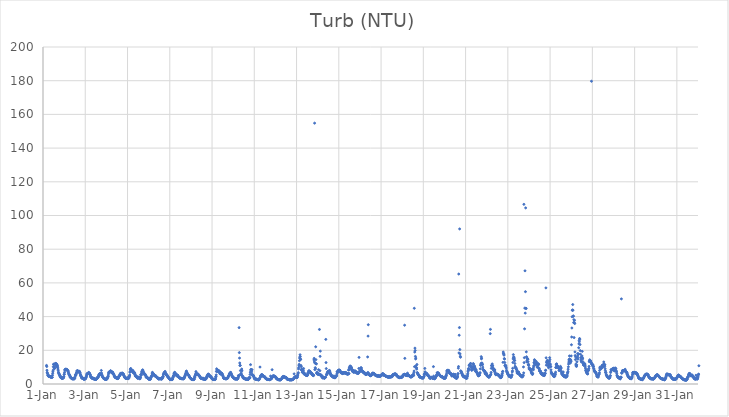
| Category | Turb (NTU) |
|---|---|
| 44927.166666666664 | 11.04 |
| 44927.177083333336 | 10.35 |
| 44927.1875 | 8.16 |
| 44927.197916666664 | 6.94 |
| 44927.208333333336 | 6.43 |
| 44927.21875 | 6.01 |
| 44927.229166666664 | 5.21 |
| 44927.239583333336 | 4.99 |
| 44927.25 | 4.79 |
| 44927.260416666664 | 4.72 |
| 44927.270833333336 | 4.5 |
| 44927.28125 | 4.51 |
| 44927.291666666664 | 4.56 |
| 44927.302083333336 | 4.73 |
| 44927.3125 | 4.68 |
| 44927.322916666664 | 4.47 |
| 44927.333333333336 | 4.37 |
| 44927.34375 | 4.4 |
| 44927.354166666664 | 4.08 |
| 44927.364583333336 | 4.2 |
| 44927.375 | 4.02 |
| 44927.385416666664 | 4.43 |
| 44927.395833333336 | 4.22 |
| 44927.40625 | 3.93 |
| 44927.416666666664 | 4.08 |
| 44927.427083333336 | 3.97 |
| 44927.4375 | 3.98 |
| 44927.447916666664 | 5.19 |
| 44927.458333333336 | 6.29 |
| 44927.46875 | 7.29 |
| 44927.479166666664 | 8.19 |
| 44927.489583333336 | 10.31 |
| 44927.5 | 11.69 |
| 44927.510416666664 | 11.7 |
| 44927.520833333336 | 9.62 |
| 44927.53125 | 9.53 |
| 44927.541666666664 | 9.23 |
| 44927.552083333336 | 9.35 |
| 44927.5625 | 10.55 |
| 44927.572916666664 | 11.88 |
| 44927.583333333336 | 12.15 |
| 44927.59375 | 12.2 |
| 44927.604166666664 | 11.62 |
| 44927.614583333336 | 11.5 |
| 44927.625 | 12.05 |
| 44927.635416666664 | 11.99 |
| 44927.645833333336 | 10.56 |
| 44927.65625 | 11.09 |
| 44927.666666666664 | 11.47 |
| 44927.677083333336 | 10.26 |
| 44927.6875 | 10.74 |
| 44927.697916666664 | 9.64 |
| 44927.708333333336 | 8.85 |
| 44927.71875 | 8.13 |
| 44927.729166666664 | 7.06 |
| 44927.739583333336 | 6.57 |
| 44927.75 | 6.37 |
| 44927.760416666664 | 5.94 |
| 44927.770833333336 | 5.75 |
| 44927.78125 | 5.54 |
| 44927.791666666664 | 5.01 |
| 44927.802083333336 | 4.73 |
| 44927.8125 | 4.63 |
| 44927.822916666664 | 4.13 |
| 44927.833333333336 | 4.05 |
| 44927.84375 | 3.89 |
| 44927.854166666664 | 3.79 |
| 44927.864583333336 | 3.78 |
| 44927.875 | 3.69 |
| 44927.885416666664 | 4.15 |
| 44927.895833333336 | 3.27 |
| 44927.90625 | 3.4 |
| 44927.916666666664 | 3.38 |
| 44927.927083333336 | 3.69 |
| 44927.9375 | 3.47 |
| 44927.947916666664 | 3.64 |
| 44927.958333333336 | 3.5 |
| 44927.96875 | 3.75 |
| 44927.979166666664 | 4.19 |
| 44927.989583333336 | 4.29 |
| 44928.0 | 5.65 |
| 44928.010416666664 | 5.83 |
| 44928.020833333336 | 6.93 |
| 44928.03125 | 8.22 |
| 44928.041666666664 | 8.55 |
| 44928.052083333336 | 8.48 |
| 44928.0625 | 8.83 |
| 44928.072916666664 | 8.27 |
| 44928.083333333336 | 8.49 |
| 44928.09375 | 8.52 |
| 44928.104166666664 | 8.64 |
| 44928.114583333336 | 8.69 |
| 44928.125 | 8.58 |
| 44928.135416666664 | 8.53 |
| 44928.145833333336 | 8.28 |
| 44928.15625 | 8.08 |
| 44928.166666666664 | 8.02 |
| 44928.177083333336 | 7.82 |
| 44928.1875 | 7.73 |
| 44928.197916666664 | 7.19 |
| 44928.208333333336 | 6.56 |
| 44928.21875 | 6.07 |
| 44928.229166666664 | 5.83 |
| 44928.239583333336 | 5.54 |
| 44928.25 | 5.04 |
| 44928.260416666664 | 5.17 |
| 44928.270833333336 | 4.98 |
| 44928.28125 | 4.26 |
| 44928.291666666664 | 4.02 |
| 44928.302083333336 | 4.07 |
| 44928.3125 | 3.96 |
| 44928.322916666664 | 3.74 |
| 44928.333333333336 | 3.45 |
| 44928.34375 | 3.41 |
| 44928.354166666664 | 3.43 |
| 44928.364583333336 | 3.43 |
| 44928.375 | 3.05 |
| 44928.385416666664 | 3.18 |
| 44928.395833333336 | 3.08 |
| 44928.40625 | 3.16 |
| 44928.416666666664 | 3.12 |
| 44928.427083333336 | 3.16 |
| 44928.4375 | 3.02 |
| 44928.447916666664 | 3.37 |
| 44928.458333333336 | 3.13 |
| 44928.46875 | 2.91 |
| 44928.479166666664 | 3.14 |
| 44928.489583333336 | 3.39 |
| 44928.5 | 3.57 |
| 44928.510416666664 | 3.53 |
| 44928.520833333336 | 4.25 |
| 44928.53125 | 5.39 |
| 44928.541666666664 | 5.11 |
| 44928.552083333336 | 5.24 |
| 44928.5625 | 5.67 |
| 44928.572916666664 | 6.07 |
| 44928.583333333336 | 6.52 |
| 44928.59375 | 6.96 |
| 44928.604166666664 | 7.66 |
| 44928.614583333336 | 7.87 |
| 44928.625 | 7.7 |
| 44928.635416666664 | 7.83 |
| 44928.645833333336 | 7.6 |
| 44928.65625 | 7.69 |
| 44928.666666666664 | 7.58 |
| 44928.677083333336 | 7.09 |
| 44928.6875 | 7.25 |
| 44928.697916666664 | 7.41 |
| 44928.708333333336 | 7.22 |
| 44928.71875 | 7.2 |
| 44928.729166666664 | 7.51 |
| 44928.739583333336 | 6.81 |
| 44928.75 | 6.71 |
| 44928.760416666664 | 6.01 |
| 44928.770833333336 | 5.35 |
| 44928.78125 | 4.98 |
| 44928.791666666664 | 5.2 |
| 44928.802083333336 | 4.6 |
| 44928.8125 | 4.38 |
| 44928.822916666664 | 3.95 |
| 44928.833333333336 | 3.57 |
| 44928.84375 | 3.47 |
| 44928.854166666664 | 3.49 |
| 44928.864583333336 | 3.77 |
| 44928.875 | 3.66 |
| 44928.885416666664 | 3.42 |
| 44928.895833333336 | 3.3 |
| 44928.90625 | 3.07 |
| 44928.916666666664 | 3.06 |
| 44928.927083333336 | 2.87 |
| 44928.9375 | 3.05 |
| 44928.947916666664 | 2.99 |
| 44928.958333333336 | 3.01 |
| 44928.96875 | 2.93 |
| 44928.979166666664 | 2.96 |
| 44928.989583333336 | 2.9 |
| 44929.0 | 3.2 |
| 44929.010416666664 | 3.2 |
| 44929.020833333336 | 3.29 |
| 44929.03125 | 3.83 |
| 44929.041666666664 | 4.02 |
| 44929.052083333336 | 4.47 |
| 44929.0625 | 5 |
| 44929.072916666664 | 5.66 |
| 44929.083333333336 | 5.97 |
| 44929.09375 | 6.15 |
| 44929.104166666664 | 6.16 |
| 44929.114583333336 | 6.25 |
| 44929.125 | 6.34 |
| 44929.135416666664 | 6.19 |
| 44929.145833333336 | 6.5 |
| 44929.15625 | 6.58 |
| 44929.166666666664 | 6.89 |
| 44929.177083333336 | 6.24 |
| 44929.1875 | 6.19 |
| 44929.197916666664 | 6.05 |
| 44929.208333333336 | 6.41 |
| 44929.21875 | 5.75 |
| 44929.229166666664 | 5.62 |
| 44929.239583333336 | 5.28 |
| 44929.25 | 4.64 |
| 44929.260416666664 | 4.24 |
| 44929.270833333336 | 4.07 |
| 44929.28125 | 3.88 |
| 44929.291666666664 | 4.08 |
| 44929.302083333336 | 3.79 |
| 44929.3125 | 3.6 |
| 44929.322916666664 | 3.49 |
| 44929.333333333336 | 3.29 |
| 44929.34375 | 3.26 |
| 44929.354166666664 | 3.28 |
| 44929.364583333336 | 3.53 |
| 44929.375 | 3.43 |
| 44929.385416666664 | 3.15 |
| 44929.395833333336 | 3.22 |
| 44929.40625 | 2.95 |
| 44929.416666666664 | 3.07 |
| 44929.427083333336 | 3.03 |
| 44929.4375 | 2.96 |
| 44929.447916666664 | 2.78 |
| 44929.458333333336 | 2.98 |
| 44929.46875 | 2.93 |
| 44929.479166666664 | 2.8 |
| 44929.489583333336 | 2.75 |
| 44929.5 | 2.71 |
| 44929.510416666664 | 2.78 |
| 44929.520833333336 | 2.87 |
| 44929.53125 | 3.08 |
| 44929.541666666664 | 3.18 |
| 44929.552083333336 | 3.38 |
| 44929.5625 | 3.32 |
| 44929.572916666664 | 3.42 |
| 44929.583333333336 | 3.84 |
| 44929.59375 | 4.21 |
| 44929.604166666664 | 4.13 |
| 44929.614583333336 | 4.11 |
| 44929.625 | 4.44 |
| 44929.635416666664 | 5.03 |
| 44929.645833333336 | 5.48 |
| 44929.65625 | 5.76 |
| 44929.666666666664 | 5.92 |
| 44929.677083333336 | 6.07 |
| 44929.6875 | 6.01 |
| 44929.697916666664 | 5.88 |
| 44929.708333333336 | 5.85 |
| 44929.71875 | 6.12 |
| 44929.729166666664 | 5.96 |
| 44929.739583333336 | 5.66 |
| 44929.75 | 5.52 |
| 44929.760416666664 | 8.04 |
| 44929.770833333336 | 6.48 |
| 44929.78125 | 5.71 |
| 44929.791666666664 | 5.17 |
| 44929.802083333336 | 4.7 |
| 44929.8125 | 4.46 |
| 44929.822916666664 | 4.21 |
| 44929.833333333336 | 4.15 |
| 44929.84375 | 3.92 |
| 44929.854166666664 | 3.6 |
| 44929.864583333336 | 3.44 |
| 44929.875 | 3.28 |
| 44929.885416666664 | 3.18 |
| 44929.895833333336 | 3.23 |
| 44929.90625 | 3.12 |
| 44929.916666666664 | 2.92 |
| 44929.927083333336 | 2.87 |
| 44929.9375 | 2.99 |
| 44929.947916666664 | 2.88 |
| 44929.958333333336 | 2.89 |
| 44929.96875 | 2.84 |
| 44929.979166666664 | 2.81 |
| 44929.989583333336 | 2.76 |
| 44930.0 | 2.77 |
| 44930.010416666664 | 3.1 |
| 44930.020833333336 | 2.85 |
| 44930.03125 | 3.12 |
| 44930.041666666664 | 3.55 |
| 44930.052083333336 | 3.82 |
| 44930.0625 | 3.78 |
| 44930.072916666664 | 4.59 |
| 44930.083333333336 | 4.47 |
| 44930.09375 | 5.38 |
| 44930.104166666664 | 6.3 |
| 44930.114583333336 | 7 |
| 44930.125 | 6.89 |
| 44930.135416666664 | 7.06 |
| 44930.145833333336 | 7.14 |
| 44930.15625 | 7.07 |
| 44930.166666666664 | 7.34 |
| 44930.177083333336 | 7.31 |
| 44930.1875 | 7.54 |
| 44930.197916666664 | 7.92 |
| 44930.208333333336 | 7.52 |
| 44930.21875 | 7.3 |
| 44930.229166666664 | 7.2 |
| 44930.239583333336 | 6.94 |
| 44930.25 | 6.66 |
| 44930.260416666664 | 6.83 |
| 44930.270833333336 | 6.94 |
| 44930.28125 | 7.03 |
| 44930.291666666664 | 7.11 |
| 44930.302083333336 | 6.64 |
| 44930.3125 | 6.5 |
| 44930.322916666664 | 6.05 |
| 44930.333333333336 | 5.96 |
| 44930.34375 | 5.67 |
| 44930.354166666664 | 5.55 |
| 44930.364583333336 | 4.81 |
| 44930.375 | 4.81 |
| 44930.385416666664 | 4.62 |
| 44930.395833333336 | 4.26 |
| 44930.40625 | 4.07 |
| 44930.416666666664 | 3.89 |
| 44930.427083333336 | 3.91 |
| 44930.4375 | 3.83 |
| 44930.447916666664 | 3.81 |
| 44930.458333333336 | 3.61 |
| 44930.46875 | 3.64 |
| 44930.479166666664 | 3.36 |
| 44930.489583333336 | 3.45 |
| 44930.5 | 3.64 |
| 44930.510416666664 | 3.4 |
| 44930.520833333336 | 3.48 |
| 44930.53125 | 3.28 |
| 44930.541666666664 | 3.17 |
| 44930.552083333336 | 3.39 |
| 44930.5625 | 3.46 |
| 44930.572916666664 | 4.25 |
| 44930.583333333336 | 4.22 |
| 44930.59375 | 4.57 |
| 44930.604166666664 | 4.78 |
| 44930.614583333336 | 4.58 |
| 44930.625 | 4.94 |
| 44930.635416666664 | 5.38 |
| 44930.645833333336 | 5.58 |
| 44930.65625 | 5.97 |
| 44930.666666666664 | 6.3 |
| 44930.677083333336 | 6.11 |
| 44930.6875 | 5.92 |
| 44930.697916666664 | 5.91 |
| 44930.708333333336 | 6.01 |
| 44930.71875 | 6.24 |
| 44930.729166666664 | 6.34 |
| 44930.739583333336 | 6.43 |
| 44930.75 | 6.48 |
| 44930.760416666664 | 6.23 |
| 44930.770833333336 | 6.29 |
| 44930.78125 | 6.02 |
| 44930.791666666664 | 5.92 |
| 44930.802083333336 | 5.67 |
| 44930.8125 | 5.81 |
| 44930.822916666664 | 5.21 |
| 44930.833333333336 | 4.99 |
| 44930.84375 | 4.62 |
| 44930.854166666664 | 4.29 |
| 44930.864583333336 | 3.92 |
| 44930.875 | 3.88 |
| 44930.885416666664 | 3.66 |
| 44930.895833333336 | 3.56 |
| 44930.90625 | 3.41 |
| 44930.916666666664 | 3.5 |
| 44930.927083333336 | 3.39 |
| 44930.9375 | 3.4 |
| 44930.947916666664 | 3.44 |
| 44930.958333333336 | 3.35 |
| 44930.96875 | 3.35 |
| 44930.979166666664 | 3.42 |
| 44930.989583333336 | 3.35 |
| 44931.0 | 3.58 |
| 44931.010416666664 | 3.66 |
| 44931.020833333336 | 3.41 |
| 44931.03125 | 3.15 |
| 44931.041666666664 | 3.44 |
| 44931.052083333336 | 3.33 |
| 44931.0625 | 3.63 |
| 44931.072916666664 | 3.76 |
| 44931.083333333336 | 4.4 |
| 44931.09375 | 4.9 |
| 44931.104166666664 | 5.34 |
| 44931.114583333336 | 6.93 |
| 44931.125 | 7.43 |
| 44931.135416666664 | 8.55 |
| 44931.145833333336 | 9.13 |
| 44931.15625 | 9.12 |
| 44931.166666666664 | 8.55 |
| 44931.177083333336 | 8.38 |
| 44931.1875 | 7.91 |
| 44931.197916666664 | 7.89 |
| 44931.208333333336 | 7.76 |
| 44931.21875 | 7.6 |
| 44931.229166666664 | 7.49 |
| 44931.239583333336 | 7.53 |
| 44931.25 | 7.34 |
| 44931.260416666664 | 8 |
| 44931.270833333336 | 6.81 |
| 44931.28125 | 6.62 |
| 44931.291666666664 | 6.65 |
| 44931.302083333336 | 6.67 |
| 44931.3125 | 6.54 |
| 44931.322916666664 | 6.85 |
| 44931.333333333336 | 6.66 |
| 44931.34375 | 6.08 |
| 44931.354166666664 | 5.71 |
| 44931.364583333336 | 5.14 |
| 44931.375 | 4.65 |
| 44931.385416666664 | 4.67 |
| 44931.395833333336 | 4.69 |
| 44931.40625 | 4.71 |
| 44931.416666666664 | 4.57 |
| 44931.427083333336 | 4.51 |
| 44931.4375 | 4.33 |
| 44931.447916666664 | 3.85 |
| 44931.458333333336 | 3.78 |
| 44931.46875 | 3.56 |
| 44931.479166666664 | 3.51 |
| 44931.489583333336 | 3.43 |
| 44931.5 | 3.74 |
| 44931.510416666664 | 4.04 |
| 44931.520833333336 | 3.76 |
| 44931.53125 | 3.89 |
| 44931.541666666664 | 3.54 |
| 44931.552083333336 | 3.55 |
| 44931.5625 | 3.43 |
| 44931.572916666664 | 3.21 |
| 44931.583333333336 | 3.09 |
| 44931.59375 | 3.13 |
| 44931.604166666664 | 3.8 |
| 44931.614583333336 | 4.01 |
| 44931.625 | 5.6 |
| 44931.635416666664 | 5.39 |
| 44931.645833333336 | 5.2 |
| 44931.65625 | 5.56 |
| 44931.666666666664 | 6.57 |
| 44931.677083333336 | 7.37 |
| 44931.6875 | 7.61 |
| 44931.697916666664 | 7.75 |
| 44931.708333333336 | 8.12 |
| 44931.71875 | 8.39 |
| 44931.729166666664 | 7.89 |
| 44931.739583333336 | 6.85 |
| 44931.75 | 7.28 |
| 44931.760416666664 | 6.62 |
| 44931.770833333336 | 6.52 |
| 44931.78125 | 6.26 |
| 44931.791666666664 | 5.73 |
| 44931.802083333336 | 5.89 |
| 44931.8125 | 5.72 |
| 44931.822916666664 | 5.94 |
| 44931.833333333336 | 5.6 |
| 44931.84375 | 5.28 |
| 44931.854166666664 | 5.16 |
| 44931.864583333336 | 4.93 |
| 44931.875 | 4.37 |
| 44931.885416666664 | 4.03 |
| 44931.895833333336 | 3.86 |
| 44931.90625 | 3.95 |
| 44931.916666666664 | 3.99 |
| 44931.927083333336 | 4.05 |
| 44931.9375 | 3.88 |
| 44931.947916666664 | 3.72 |
| 44931.958333333336 | 3.32 |
| 44931.96875 | 3.36 |
| 44931.979166666664 | 3.14 |
| 44931.989583333336 | 3.14 |
| 44932.0 | 3.02 |
| 44932.010416666664 | 3 |
| 44932.020833333336 | 2.79 |
| 44932.03125 | 2.81 |
| 44932.041666666664 | 2.81 |
| 44932.052083333336 | 3.05 |
| 44932.0625 | 3.49 |
| 44932.072916666664 | 2.79 |
| 44932.083333333336 | 2.78 |
| 44932.09375 | 3.35 |
| 44932.104166666664 | 3.72 |
| 44932.114583333336 | 3.95 |
| 44932.125 | 4.36 |
| 44932.135416666664 | 4.53 |
| 44932.145833333336 | 4.83 |
| 44932.15625 | 5.16 |
| 44932.166666666664 | 6.03 |
| 44932.177083333336 | 6.91 |
| 44932.1875 | 6.63 |
| 44932.197916666664 | 5.72 |
| 44932.208333333336 | 6.3 |
| 44932.21875 | 6.09 |
| 44932.229166666664 | 5.9 |
| 44932.239583333336 | 5.84 |
| 44932.25 | 5.59 |
| 44932.260416666664 | 5.53 |
| 44932.270833333336 | 4.82 |
| 44932.28125 | 4.97 |
| 44932.291666666664 | 5.1 |
| 44932.302083333336 | 5.1 |
| 44932.3125 | 4.96 |
| 44932.322916666664 | 4.99 |
| 44932.333333333336 | 4.66 |
| 44932.34375 | 4.65 |
| 44932.354166666664 | 4.42 |
| 44932.364583333336 | 4.3 |
| 44932.375 | 4.27 |
| 44932.385416666664 | 4.11 |
| 44932.395833333336 | 3.69 |
| 44932.40625 | 3.69 |
| 44932.416666666664 | 3.59 |
| 44932.427083333336 | 3.74 |
| 44932.4375 | 3.57 |
| 44932.447916666664 | 3.4 |
| 44932.458333333336 | 3.13 |
| 44932.46875 | 3.09 |
| 44932.479166666664 | 3 |
| 44932.489583333336 | 3.05 |
| 44932.5 | 3.21 |
| 44932.510416666664 | 3.11 |
| 44932.520833333336 | 3.09 |
| 44932.53125 | 3.2 |
| 44932.541666666664 | 3.17 |
| 44932.552083333336 | 3.11 |
| 44932.5625 | 3.09 |
| 44932.572916666664 | 3.16 |
| 44932.583333333336 | 3.13 |
| 44932.59375 | 3.17 |
| 44932.604166666664 | 3.02 |
| 44932.614583333336 | 2.92 |
| 44932.625 | 3 |
| 44932.635416666664 | 3.22 |
| 44932.645833333336 | 3.57 |
| 44932.65625 | 3.58 |
| 44932.666666666664 | 4.4 |
| 44932.677083333336 | 4.14 |
| 44932.6875 | 4.32 |
| 44932.697916666664 | 5.51 |
| 44932.708333333336 | 5.95 |
| 44932.71875 | 6.02 |
| 44932.729166666664 | 6.61 |
| 44932.739583333336 | 6.78 |
| 44932.75 | 6.56 |
| 44932.760416666664 | 7.13 |
| 44932.770833333336 | 6.99 |
| 44932.78125 | 7.46 |
| 44932.791666666664 | 6.68 |
| 44932.802083333336 | 6.25 |
| 44932.8125 | 5.99 |
| 44932.822916666664 | 5.76 |
| 44932.833333333336 | 5.77 |
| 44932.84375 | 5.25 |
| 44932.854166666664 | 5.35 |
| 44932.864583333336 | 5.47 |
| 44932.875 | 5.02 |
| 44932.885416666664 | 4.79 |
| 44932.895833333336 | 4.62 |
| 44932.90625 | 4.15 |
| 44932.916666666664 | 4.13 |
| 44932.927083333336 | 4.03 |
| 44932.9375 | 3.9 |
| 44932.947916666664 | 3.77 |
| 44932.958333333336 | 3.64 |
| 44932.96875 | 3.25 |
| 44932.979166666664 | 3.14 |
| 44932.989583333336 | 3.01 |
| 44933.0 | 2.8 |
| 44933.010416666664 | 2.75 |
| 44933.020833333336 | 2.73 |
| 44933.03125 | 2.72 |
| 44933.041666666664 | 2.72 |
| 44933.052083333336 | 2.63 |
| 44933.0625 | 2.8 |
| 44933.072916666664 | 2.62 |
| 44933.083333333336 | 2.79 |
| 44933.09375 | 2.65 |
| 44933.104166666664 | 2.68 |
| 44933.114583333336 | 2.61 |
| 44933.125 | 2.72 |
| 44933.135416666664 | 3.27 |
| 44933.145833333336 | 3.9 |
| 44933.15625 | 4.03 |
| 44933.166666666664 | 4.4 |
| 44933.177083333336 | 4.9 |
| 44933.1875 | 5.06 |
| 44933.197916666664 | 6.38 |
| 44933.208333333336 | 5.57 |
| 44933.21875 | 6.38 |
| 44933.229166666664 | 6.94 |
| 44933.239583333336 | 6.72 |
| 44933.25 | 6.6 |
| 44933.260416666664 | 5.99 |
| 44933.270833333336 | 5.54 |
| 44933.28125 | 5.78 |
| 44933.291666666664 | 5.5 |
| 44933.302083333336 | 5.67 |
| 44933.3125 | 5.71 |
| 44933.322916666664 | 4.85 |
| 44933.333333333336 | 5.06 |
| 44933.34375 | 5.05 |
| 44933.354166666664 | 5.23 |
| 44933.364583333336 | 5.13 |
| 44933.375 | 5.19 |
| 44933.385416666664 | 4.99 |
| 44933.395833333336 | 4.43 |
| 44933.40625 | 4.28 |
| 44933.416666666664 | 4.07 |
| 44933.427083333336 | 4 |
| 44933.4375 | 4.13 |
| 44933.447916666664 | 3.74 |
| 44933.458333333336 | 3.66 |
| 44933.46875 | 3.52 |
| 44933.479166666664 | 3.54 |
| 44933.489583333336 | 3.48 |
| 44933.5 | 3.36 |
| 44933.510416666664 | 3.39 |
| 44933.520833333336 | 3.32 |
| 44933.53125 | 3.26 |
| 44933.541666666664 | 3.15 |
| 44933.552083333336 | 3.33 |
| 44933.5625 | 3.25 |
| 44933.572916666664 | 3.11 |
| 44933.583333333336 | 3.09 |
| 44933.59375 | 3.12 |
| 44933.604166666664 | 3.19 |
| 44933.614583333336 | 3.25 |
| 44933.625 | 3.36 |
| 44933.635416666664 | 3.08 |
| 44933.645833333336 | 3.13 |
| 44933.65625 | 3.15 |
| 44933.666666666664 | 3.31 |
| 44933.677083333336 | 3.78 |
| 44933.6875 | 3.58 |
| 44933.697916666664 | 4.02 |
| 44933.708333333336 | 4.32 |
| 44933.71875 | 4.82 |
| 44933.729166666664 | 4.94 |
| 44933.739583333336 | 5.64 |
| 44933.75 | 5.77 |
| 44933.760416666664 | 6.14 |
| 44933.770833333336 | 6.74 |
| 44933.78125 | 7.53 |
| 44933.791666666664 | 7.63 |
| 44933.802083333336 | 6.68 |
| 44933.8125 | 6.75 |
| 44933.822916666664 | 5.79 |
| 44933.833333333336 | 5.94 |
| 44933.84375 | 5.82 |
| 44933.854166666664 | 5.68 |
| 44933.864583333336 | 5.65 |
| 44933.875 | 5.41 |
| 44933.885416666664 | 5.39 |
| 44933.895833333336 | 5.03 |
| 44933.90625 | 5.04 |
| 44933.916666666664 | 4.66 |
| 44933.927083333336 | 4.27 |
| 44933.9375 | 4.05 |
| 44933.947916666664 | 3.84 |
| 44933.958333333336 | 3.79 |
| 44933.96875 | 3.55 |
| 44933.979166666664 | 3.47 |
| 44933.989583333336 | 3.32 |
| 44934.0 | 3.27 |
| 44934.010416666664 | 2.99 |
| 44934.020833333336 | 2.99 |
| 44934.03125 | 2.77 |
| 44934.041666666664 | 2.81 |
| 44934.052083333336 | 2.63 |
| 44934.0625 | 2.61 |
| 44934.072916666664 | 2.69 |
| 44934.083333333336 | 2.7 |
| 44934.09375 | 2.66 |
| 44934.104166666664 | 2.57 |
| 44934.114583333336 | 2.77 |
| 44934.125 | 2.67 |
| 44934.135416666664 | 2.6 |
| 44934.145833333336 | 2.91 |
| 44934.15625 | 2.82 |
| 44934.166666666664 | 3.57 |
| 44934.177083333336 | 4.42 |
| 44934.1875 | 4.04 |
| 44934.197916666664 | 4.82 |
| 44934.208333333336 | 5.19 |
| 44934.21875 | 5.85 |
| 44934.229166666664 | 5.72 |
| 44934.239583333336 | 7.37 |
| 44934.25 | 6.6 |
| 44934.260416666664 | 6.34 |
| 44934.270833333336 | 5.94 |
| 44934.28125 | 6 |
| 44934.291666666664 | 5.61 |
| 44934.302083333336 | 5.78 |
| 44934.3125 | 5.69 |
| 44934.322916666664 | 5.76 |
| 44934.333333333336 | 5.69 |
| 44934.34375 | 5.9 |
| 44934.354166666664 | 5.37 |
| 44934.364583333336 | 5.08 |
| 44934.375 | 5.06 |
| 44934.385416666664 | 5.1 |
| 44934.395833333336 | 5.02 |
| 44934.40625 | 4.91 |
| 44934.416666666664 | 4.5 |
| 44934.427083333336 | 4.26 |
| 44934.4375 | 3.78 |
| 44934.447916666664 | 3.67 |
| 44934.458333333336 | 3.69 |
| 44934.46875 | 3.5 |
| 44934.479166666664 | 3.3 |
| 44934.489583333336 | 3.44 |
| 44934.5 | 3.41 |
| 44934.510416666664 | 3.38 |
| 44934.520833333336 | 3.15 |
| 44934.53125 | 3.31 |
| 44934.541666666664 | 3.31 |
| 44934.552083333336 | 3.1 |
| 44934.5625 | 3.06 |
| 44934.572916666664 | 3.53 |
| 44934.583333333336 | 2.96 |
| 44934.59375 | 2.9 |
| 44934.604166666664 | 2.91 |
| 44934.614583333336 | 3.14 |
| 44934.625 | 2.95 |
| 44934.635416666664 | 2.85 |
| 44934.645833333336 | 2.87 |
| 44934.65625 | 2.86 |
| 44934.666666666664 | 2.66 |
| 44934.677083333336 | 2.86 |
| 44934.6875 | 2.84 |
| 44934.697916666664 | 3.05 |
| 44934.708333333336 | 2.93 |
| 44934.71875 | 3.17 |
| 44934.729166666664 | 3.68 |
| 44934.739583333336 | 3.86 |
| 44934.75 | 4.62 |
| 44934.760416666664 | 3.91 |
| 44934.770833333336 | 4.53 |
| 44934.78125 | 4.85 |
| 44934.791666666664 | 5.27 |
| 44934.802083333336 | 5.66 |
| 44934.8125 | 5.67 |
| 44934.822916666664 | 5.95 |
| 44934.833333333336 | 5.49 |
| 44934.84375 | 5.38 |
| 44934.854166666664 | 5.62 |
| 44934.864583333336 | 5.3 |
| 44934.875 | 4.8 |
| 44934.885416666664 | 4.57 |
| 44934.895833333336 | 4.54 |
| 44934.90625 | 4.85 |
| 44934.916666666664 | 4.5 |
| 44934.927083333336 | 4.5 |
| 44934.9375 | 4.35 |
| 44934.947916666664 | 4.33 |
| 44934.958333333336 | 4.08 |
| 44934.96875 | 3.91 |
| 44934.979166666664 | 3.52 |
| 44934.989583333336 | 3.12 |
| 44935.0 | 3.19 |
| 44935.010416666664 | 3.26 |
| 44935.020833333336 | 3.02 |
| 44935.03125 | 3 |
| 44935.041666666664 | 2.77 |
| 44935.052083333336 | 2.76 |
| 44935.0625 | 2.79 |
| 44935.072916666664 | 2.76 |
| 44935.083333333336 | 2.65 |
| 44935.09375 | 2.67 |
| 44935.104166666664 | 2.67 |
| 44935.114583333336 | 2.66 |
| 44935.125 | 2.86 |
| 44935.135416666664 | 2.74 |
| 44935.145833333336 | 2.65 |
| 44935.15625 | 2.79 |
| 44935.166666666664 | 3.37 |
| 44935.177083333336 | 4.4 |
| 44935.1875 | 4.28 |
| 44935.197916666664 | 5.4 |
| 44935.208333333336 | 7.43 |
| 44935.21875 | 9.01 |
| 44935.229166666664 | 8.31 |
| 44935.239583333336 | 7.57 |
| 44935.25 | 8.38 |
| 44935.260416666664 | 7.6 |
| 44935.270833333336 | 7.6 |
| 44935.28125 | 7.84 |
| 44935.291666666664 | 8.07 |
| 44935.302083333336 | 7.94 |
| 44935.3125 | 7.79 |
| 44935.322916666664 | 7.31 |
| 44935.333333333336 | 7.62 |
| 44935.34375 | 7.63 |
| 44935.354166666664 | 7.48 |
| 44935.364583333336 | 6.28 |
| 44935.375 | 6.63 |
| 44935.385416666664 | 6.47 |
| 44935.395833333336 | 5.92 |
| 44935.40625 | 5.89 |
| 44935.416666666664 | 6.52 |
| 44935.427083333336 | 6.44 |
| 44935.4375 | 6.62 |
| 44935.447916666664 | 6.29 |
| 44935.458333333336 | 6.39 |
| 44935.46875 | 5.99 |
| 44935.479166666664 | 6.04 |
| 44935.489583333336 | 5.67 |
| 44935.5 | 5.19 |
| 44935.510416666664 | 4.74 |
| 44935.520833333336 | 4.77 |
| 44935.53125 | 4.14 |
| 44935.541666666664 | 3.67 |
| 44935.552083333336 | 3.65 |
| 44935.5625 | 3.41 |
| 44935.572916666664 | 3.23 |
| 44935.583333333336 | 3.25 |
| 44935.59375 | 3.33 |
| 44935.604166666664 | 3.36 |
| 44935.614583333336 | 3.45 |
| 44935.625 | 3.21 |
| 44935.635416666664 | 3.09 |
| 44935.645833333336 | 3.11 |
| 44935.65625 | 3.22 |
| 44935.666666666664 | 3.13 |
| 44935.677083333336 | 3.17 |
| 44935.6875 | 3.18 |
| 44935.697916666664 | 3.14 |
| 44935.708333333336 | 3.18 |
| 44935.71875 | 3.38 |
| 44935.729166666664 | 3.43 |
| 44935.739583333336 | 3.43 |
| 44935.75 | 3.7 |
| 44935.760416666664 | 4.13 |
| 44935.770833333336 | 4.54 |
| 44935.78125 | 4.52 |
| 44935.791666666664 | 4.87 |
| 44935.802083333336 | 4.91 |
| 44935.8125 | 5.51 |
| 44935.822916666664 | 6.06 |
| 44935.833333333336 | 6.13 |
| 44935.84375 | 6.4 |
| 44935.854166666664 | 6.43 |
| 44935.864583333336 | 6.62 |
| 44935.875 | 6.82 |
| 44935.885416666664 | 6.92 |
| 44935.895833333336 | 6.11 |
| 44935.90625 | 6.13 |
| 44935.916666666664 | 5.74 |
| 44935.927083333336 | 5.41 |
| 44935.9375 | 5.19 |
| 44935.947916666664 | 4.78 |
| 44935.958333333336 | 4.5 |
| 44935.96875 | 4.43 |
| 44935.979166666664 | 4.19 |
| 44935.989583333336 | 3.89 |
| 44936.0 | 3.91 |
| 44936.010416666664 | 3.69 |
| 44936.020833333336 | 3.61 |
| 44936.03125 | 3.55 |
| 44936.041666666664 | 3.49 |
| 44936.052083333336 | 3.47 |
| 44936.0625 | 3.23 |
| 44936.072916666664 | 3.01 |
| 44936.083333333336 | 3.15 |
| 44936.09375 | 3.01 |
| 44936.104166666664 | 3.07 |
| 44936.114583333336 | 3.05 |
| 44936.125 | 2.89 |
| 44936.135416666664 | 3.28 |
| 44936.145833333336 | 3.31 |
| 44936.15625 | 3.07 |
| 44936.166666666664 | 2.9 |
| 44936.177083333336 | 2.99 |
| 44936.1875 | 3.01 |
| 44936.197916666664 | 2.95 |
| 44936.208333333336 | 3.02 |
| 44936.21875 | 3.22 |
| 44936.229166666664 | 3.58 |
| 44936.239583333336 | 3.73 |
| 44936.25 | 5.03 |
| 44936.260416666664 | 4.62 |
| 44936.270833333336 | 5.01 |
| 44936.28125 | 33.45 |
| 44936.291666666664 | 18.63 |
| 44936.302083333336 | 15.39 |
| 44936.3125 | 12.47 |
| 44936.322916666664 | 10.96 |
| 44936.333333333336 | 11.04 |
| 44936.34375 | 7.96 |
| 44936.354166666664 | 5.97 |
| 44936.364583333336 | 5.6 |
| 44936.375 | 5.88 |
| 44936.385416666664 | 6.45 |
| 44936.395833333336 | 5.18 |
| 44936.40625 | 8.88 |
| 44936.416666666664 | 7.85 |
| 44936.427083333336 | 4.89 |
| 44936.4375 | 4.81 |
| 44936.447916666664 | 4.28 |
| 44936.458333333336 | 4.09 |
| 44936.46875 | 3.61 |
| 44936.479166666664 | 3.65 |
| 44936.489583333336 | 3.54 |
| 44936.5 | 3.64 |
| 44936.510416666664 | 3.51 |
| 44936.520833333336 | 3.4 |
| 44936.53125 | 3.41 |
| 44936.541666666664 | 3.29 |
| 44936.552083333336 | 3.09 |
| 44936.5625 | 3 |
| 44936.572916666664 | 3.07 |
| 44936.583333333336 | 2.95 |
| 44936.59375 | 2.89 |
| 44936.604166666664 | 2.86 |
| 44936.614583333336 | 2.89 |
| 44936.625 | 2.82 |
| 44936.635416666664 | 2.83 |
| 44936.645833333336 | 2.83 |
| 44936.65625 | 2.97 |
| 44936.666666666664 | 2.97 |
| 44936.677083333336 | 2.8 |
| 44936.6875 | 2.82 |
| 44936.697916666664 | 2.7 |
| 44936.708333333336 | 2.73 |
| 44936.71875 | 2.85 |
| 44936.729166666664 | 2.96 |
| 44936.739583333336 | 3.06 |
| 44936.75 | 3.86 |
| 44936.760416666664 | 3.44 |
| 44936.770833333336 | 3.49 |
| 44936.78125 | 3.44 |
| 44936.791666666664 | 3.87 |
| 44936.802083333336 | 5.66 |
| 44936.8125 | 7 |
| 44936.822916666664 | 11.48 |
| 44936.833333333336 | 8.3 |
| 44936.84375 | 8.67 |
| 44936.854166666664 | 8.25 |
| 44936.864583333336 | 8.44 |
| 44936.875 | 7.21 |
| 44936.885416666664 | 5.88 |
| 44936.895833333336 | 8.49 |
| 44936.90625 | 5.43 |
| 44936.916666666664 | 5.12 |
| 44936.927083333336 | 4.96 |
| 44936.9375 | 5.26 |
| 44936.947916666664 | 5.13 |
| 44936.958333333336 | 4.79 |
| 44936.96875 | 4.75 |
| 44936.979166666664 | 4.36 |
| 44936.989583333336 | 3.9 |
| 44937.0 | 3.42 |
| 44937.010416666664 | 3.15 |
| 44937.020833333336 | 3.09 |
| 44937.03125 | 3.16 |
| 44937.041666666664 | 2.97 |
| 44937.052083333336 | 2.88 |
| 44937.0625 | 2.96 |
| 44937.072916666664 | 2.76 |
| 44937.083333333336 | 2.87 |
| 44937.09375 | 2.81 |
| 44937.104166666664 | 2.94 |
| 44937.114583333336 | 2.7 |
| 44937.125 | 2.6 |
| 44937.135416666664 | 2.63 |
| 44937.145833333336 | 2.66 |
| 44937.15625 | 2.62 |
| 44937.166666666664 | 2.64 |
| 44937.177083333336 | 2.76 |
| 44937.1875 | 2.5 |
| 44937.197916666664 | 2.52 |
| 44937.208333333336 | 2.52 |
| 44937.21875 | 2.52 |
| 44937.229166666664 | 2.62 |
| 44937.239583333336 | 3.02 |
| 44937.25 | 3.3 |
| 44937.260416666664 | 3.51 |
| 44937.270833333336 | 10.06 |
| 44937.28125 | 3.97 |
| 44937.291666666664 | 4.16 |
| 44937.302083333336 | 4.88 |
| 44937.3125 | 4.82 |
| 44937.322916666664 | 5 |
| 44937.333333333336 | 5.43 |
| 44937.34375 | 5.57 |
| 44937.354166666664 | 5.5 |
| 44937.364583333336 | 5.13 |
| 44937.375 | 5.3 |
| 44937.385416666664 | 5.35 |
| 44937.395833333336 | 5.17 |
| 44937.40625 | 4.56 |
| 44937.416666666664 | 4.92 |
| 44937.427083333336 | 4.65 |
| 44937.4375 | 4.74 |
| 44937.447916666664 | 4.62 |
| 44937.458333333336 | 4.44 |
| 44937.46875 | 4.24 |
| 44937.479166666664 | 4.13 |
| 44937.489583333336 | 4.04 |
| 44937.5 | 4.36 |
| 44937.510416666664 | 3.72 |
| 44937.520833333336 | 3.56 |
| 44937.53125 | 3.4 |
| 44937.541666666664 | 3.27 |
| 44937.552083333336 | 3.21 |
| 44937.5625 | 3.13 |
| 44937.572916666664 | 2.96 |
| 44937.583333333336 | 2.97 |
| 44937.59375 | 2.92 |
| 44937.604166666664 | 2.79 |
| 44937.614583333336 | 2.85 |
| 44937.625 | 2.73 |
| 44937.635416666664 | 2.66 |
| 44937.645833333336 | 2.69 |
| 44937.65625 | 2.76 |
| 44937.666666666664 | 2.68 |
| 44937.677083333336 | 2.73 |
| 44937.6875 | 2.66 |
| 44937.697916666664 | 2.64 |
| 44937.708333333336 | 2.65 |
| 44937.71875 | 2.66 |
| 44937.729166666664 | 2.53 |
| 44937.739583333336 | 2.64 |
| 44937.75 | 2.65 |
| 44937.760416666664 | 2.68 |
| 44937.770833333336 | 4.7 |
| 44937.78125 | 3.08 |
| 44937.791666666664 | 3.35 |
| 44937.802083333336 | 3.5 |
| 44937.8125 | 3.06 |
| 44937.822916666664 | 3.4 |
| 44937.833333333336 | 3.74 |
| 44937.84375 | 8.48 |
| 44937.854166666664 | 4.05 |
| 44937.864583333336 | 4.36 |
| 44937.875 | 4.74 |
| 44937.885416666664 | 4.54 |
| 44937.895833333336 | 4.84 |
| 44937.90625 | 4.78 |
| 44937.916666666664 | 4.65 |
| 44937.927083333336 | 4.64 |
| 44937.9375 | 4.53 |
| 44937.947916666664 | 4.84 |
| 44937.958333333336 | 4.38 |
| 44937.96875 | 4.36 |
| 44937.979166666664 | 4.29 |
| 44937.989583333336 | 4.27 |
| 44938.0 | 4.21 |
| 44938.010416666664 | 4.14 |
| 44938.020833333336 | 4.11 |
| 44938.03125 | 3.81 |
| 44938.041666666664 | 3.36 |
| 44938.052083333336 | 3.14 |
| 44938.0625 | 3.1 |
| 44938.072916666664 | 3.11 |
| 44938.083333333336 | 3.03 |
| 44938.09375 | 2.9 |
| 44938.104166666664 | 2.76 |
| 44938.114583333336 | 2.63 |
| 44938.125 | 2.68 |
| 44938.135416666664 | 2.58 |
| 44938.145833333336 | 2.69 |
| 44938.15625 | 2.52 |
| 44938.166666666664 | 2.62 |
| 44938.177083333336 | 2.48 |
| 44938.1875 | 2.44 |
| 44938.197916666664 | 2.6 |
| 44938.208333333336 | 2.47 |
| 44938.21875 | 2.58 |
| 44938.229166666664 | 2.49 |
| 44938.239583333336 | 2.48 |
| 44938.25 | 2.54 |
| 44938.260416666664 | 2.77 |
| 44938.270833333336 | 2.9 |
| 44938.28125 | 3.04 |
| 44938.291666666664 | 3.17 |
| 44938.302083333336 | 3.24 |
| 44938.3125 | 3.46 |
| 44938.322916666664 | 3.7 |
| 44938.333333333336 | 4.2 |
| 44938.34375 | 3.86 |
| 44938.354166666664 | 4.02 |
| 44938.364583333336 | 4.5 |
| 44938.375 | 4.22 |
| 44938.385416666664 | 4.19 |
| 44938.395833333336 | 4.47 |
| 44938.40625 | 4.09 |
| 44938.416666666664 | 4.06 |
| 44938.427083333336 | 4.12 |
| 44938.4375 | 4.18 |
| 44938.447916666664 | 4.19 |
| 44938.458333333336 | 3.98 |
| 44938.46875 | 3.91 |
| 44938.479166666664 | 3.88 |
| 44938.489583333336 | 3.85 |
| 44938.5 | 3.84 |
| 44938.510416666664 | 3.78 |
| 44938.520833333336 | 3.7 |
| 44938.53125 | 3.44 |
| 44938.541666666664 | 3.13 |
| 44938.552083333336 | 2.89 |
| 44938.5625 | 2.8 |
| 44938.572916666664 | 2.8 |
| 44938.583333333336 | 2.68 |
| 44938.59375 | 2.7 |
| 44938.604166666664 | 2.75 |
| 44938.614583333336 | 2.72 |
| 44938.625 | 2.66 |
| 44938.635416666664 | 2.69 |
| 44938.645833333336 | 2.64 |
| 44938.65625 | 2.57 |
| 44938.666666666664 | 2.5 |
| 44938.677083333336 | 2.44 |
| 44938.6875 | 2.5 |
| 44938.697916666664 | 2.53 |
| 44938.708333333336 | 2.48 |
| 44938.71875 | 2.51 |
| 44938.729166666664 | 2.53 |
| 44938.739583333336 | 2.58 |
| 44938.75 | 2.46 |
| 44938.760416666664 | 2.49 |
| 44938.770833333336 | 2.5 |
| 44938.78125 | 2.56 |
| 44938.791666666664 | 2.61 |
| 44938.802083333336 | 2.6 |
| 44938.8125 | 2.6 |
| 44938.822916666664 | 2.88 |
| 44938.833333333336 | 2.94 |
| 44938.84375 | 2.88 |
| 44938.854166666664 | 2.93 |
| 44938.864583333336 | 3.14 |
| 44938.875 | 3.36 |
| 44938.885416666664 | 6.01 |
| 44938.895833333336 | 3.8 |
| 44938.90625 | 3.94 |
| 44938.916666666664 | 4.08 |
| 44938.927083333336 | 4.19 |
| 44938.9375 | 4.21 |
| 44938.947916666664 | 4.3 |
| 44938.958333333336 | 4.29 |
| 44938.96875 | 4.24 |
| 44938.979166666664 | 4.15 |
| 44938.989583333336 | 3.88 |
| 44939.0 | 3.82 |
| 44939.010416666664 | 3.88 |
| 44939.020833333336 | 3.73 |
| 44939.03125 | 4 |
| 44939.041666666664 | 4.52 |
| 44939.052083333336 | 5.31 |
| 44939.0625 | 5.34 |
| 44939.072916666664 | 6.29 |
| 44939.083333333336 | 6.76 |
| 44939.09375 | 8.93 |
| 44939.104166666664 | 9.76 |
| 44939.114583333336 | 10.85 |
| 44939.125 | 11.63 |
| 44939.135416666664 | 13.81 |
| 44939.145833333336 | 15.35 |
| 44939.15625 | 16 |
| 44939.166666666664 | 17.35 |
| 44939.177083333336 | 16.28 |
| 44939.1875 | 14.53 |
| 44939.197916666664 | 14.7 |
| 44939.208333333336 | 11 |
| 44939.21875 | 8.46 |
| 44939.229166666664 | 10.22 |
| 44939.239583333336 | 8.74 |
| 44939.25 | 8.14 |
| 44939.260416666664 | 8.57 |
| 44939.270833333336 | 6.97 |
| 44939.28125 | 7.07 |
| 44939.291666666664 | 7.15 |
| 44939.302083333336 | 7.16 |
| 44939.3125 | 7.3 |
| 44939.322916666664 | 8.06 |
| 44939.333333333336 | 9.18 |
| 44939.34375 | 6.41 |
| 44939.354166666664 | 6.04 |
| 44939.364583333336 | 5.82 |
| 44939.375 | 5.91 |
| 44939.385416666664 | 6.19 |
| 44939.395833333336 | 6.05 |
| 44939.40625 | 5.65 |
| 44939.416666666664 | 5.62 |
| 44939.427083333336 | 5.43 |
| 44939.4375 | 5.35 |
| 44939.447916666664 | 5.24 |
| 44939.458333333336 | 5.14 |
| 44939.46875 | 5.16 |
| 44939.479166666664 | 5.18 |
| 44939.489583333336 | 5.08 |
| 44939.5 | 4.93 |
| 44939.510416666664 | 5.11 |
| 44939.520833333336 | 5.5 |
| 44939.53125 | 5.72 |
| 44939.541666666664 | 6.58 |
| 44939.552083333336 | 6.64 |
| 44939.5625 | 6.85 |
| 44939.572916666664 | 7.61 |
| 44939.583333333336 | 7.85 |
| 44939.59375 | 7.3 |
| 44939.604166666664 | 7.63 |
| 44939.614583333336 | 7.61 |
| 44939.625 | 7.49 |
| 44939.635416666664 | 7.53 |
| 44939.645833333336 | 7.06 |
| 44939.65625 | 6.74 |
| 44939.666666666664 | 6.67 |
| 44939.677083333336 | 6.48 |
| 44939.6875 | 6.72 |
| 44939.697916666664 | 6.33 |
| 44939.708333333336 | 6.38 |
| 44939.71875 | 6.32 |
| 44939.729166666664 | 5.87 |
| 44939.739583333336 | 5.48 |
| 44939.75 | 5.71 |
| 44939.760416666664 | 5.66 |
| 44939.770833333336 | 5.13 |
| 44939.78125 | 5.15 |
| 44939.791666666664 | 5.25 |
| 44939.802083333336 | 4.96 |
| 44939.8125 | 5.24 |
| 44939.822916666664 | 14.31 |
| 44939.833333333336 | 15.2 |
| 44939.84375 | 13.08 |
| 44939.854166666664 | 154.81 |
| 44939.864583333336 | 8.52 |
| 44939.875 | 12.38 |
| 44939.885416666664 | 9.7 |
| 44939.895833333336 | 9.03 |
| 44939.90625 | 22.08 |
| 44939.916666666664 | 14.46 |
| 44939.927083333336 | 11.93 |
| 44939.9375 | 12 |
| 44939.947916666664 | 6.43 |
| 44939.958333333336 | 6.53 |
| 44939.96875 | 7.06 |
| 44939.979166666664 | 6.11 |
| 44939.989583333336 | 5.82 |
| 44940.0 | 5.97 |
| 44940.010416666664 | 6.31 |
| 44940.020833333336 | 5.97 |
| 44940.03125 | 5.83 |
| 44940.041666666664 | 8.51 |
| 44940.052083333336 | 6.01 |
| 44940.0625 | 5.54 |
| 44940.072916666664 | 5.43 |
| 44940.083333333336 | 32.38 |
| 44940.09375 | 5.73 |
| 44940.104166666664 | 7.9 |
| 44940.114583333336 | 16.4 |
| 44940.125 | 19.51 |
| 44940.135416666664 | 5.31 |
| 44940.145833333336 | 5.45 |
| 44940.15625 | 5.39 |
| 44940.166666666664 | 5.09 |
| 44940.177083333336 | 5.03 |
| 44940.1875 | 4.48 |
| 44940.197916666664 | 4.36 |
| 44940.208333333336 | 4.1 |
| 44940.21875 | 4 |
| 44940.229166666664 | 3.72 |
| 44940.239583333336 | 3.71 |
| 44940.25 | 3.63 |
| 44940.260416666664 | 3.72 |
| 44940.270833333336 | 4.16 |
| 44940.28125 | 3.98 |
| 44940.291666666664 | 3.71 |
| 44940.302083333336 | 3.63 |
| 44940.3125 | 3.38 |
| 44940.322916666664 | 3.62 |
| 44940.333333333336 | 3.52 |
| 44940.34375 | 3.82 |
| 44940.354166666664 | 3.92 |
| 44940.364583333336 | 4.04 |
| 44940.375 | 4.03 |
| 44940.385416666664 | 26.48 |
| 44940.395833333336 | 12.71 |
| 44940.40625 | 9.14 |
| 44940.416666666664 | 5.46 |
| 44940.427083333336 | 5.83 |
| 44940.4375 | 5.66 |
| 44940.447916666664 | 6.18 |
| 44940.458333333336 | 6.85 |
| 44940.46875 | 6.93 |
| 44940.479166666664 | 6.75 |
| 44940.489583333336 | 7.46 |
| 44940.5 | 7.57 |
| 44940.510416666664 | 7.63 |
| 44940.520833333336 | 7.32 |
| 44940.53125 | 7.21 |
| 44940.541666666664 | 6.9 |
| 44940.552083333336 | 7.67 |
| 44940.5625 | 8.05 |
| 44940.572916666664 | 7.51 |
| 44940.583333333336 | 6.61 |
| 44940.59375 | 6.48 |
| 44940.604166666664 | 5.89 |
| 44940.614583333336 | 5.9 |
| 44940.625 | 5.38 |
| 44940.635416666664 | 5.18 |
| 44940.645833333336 | 5.04 |
| 44940.65625 | 4.69 |
| 44940.666666666664 | 4.78 |
| 44940.677083333336 | 4.9 |
| 44940.6875 | 4.75 |
| 44940.697916666664 | 4.52 |
| 44940.708333333336 | 4.39 |
| 44940.71875 | 4.16 |
| 44940.729166666664 | 4.1 |
| 44940.739583333336 | 4.03 |
| 44940.75 | 3.96 |
| 44940.760416666664 | 4.06 |
| 44940.770833333336 | 4.79 |
| 44940.78125 | 3.94 |
| 44940.791666666664 | 3.84 |
| 44940.802083333336 | 3.97 |
| 44940.8125 | 3.67 |
| 44940.822916666664 | 3.81 |
| 44940.833333333336 | 3.79 |
| 44940.84375 | 3.98 |
| 44940.854166666664 | 4.33 |
| 44940.864583333336 | 4.46 |
| 44940.875 | 4.53 |
| 44940.885416666664 | 4.79 |
| 44940.895833333336 | 5.09 |
| 44940.90625 | 5.94 |
| 44940.916666666664 | 7.27 |
| 44940.927083333336 | 7.14 |
| 44940.9375 | 6.84 |
| 44940.947916666664 | 6.86 |
| 44940.958333333336 | 7.62 |
| 44940.96875 | 7.91 |
| 44940.979166666664 | 8.11 |
| 44940.989583333336 | 8.23 |
| 44941.0 | 7.93 |
| 44941.010416666664 | 8.12 |
| 44941.020833333336 | 8.17 |
| 44941.03125 | 8.18 |
| 44941.041666666664 | 8.11 |
| 44941.052083333336 | 8.08 |
| 44941.0625 | 7.68 |
| 44941.072916666664 | 7.24 |
| 44941.083333333336 | 7.08 |
| 44941.09375 | 6.83 |
| 44941.104166666664 | 6.81 |
| 44941.114583333336 | 6.56 |
| 44941.125 | 6.79 |
| 44941.135416666664 | 6.85 |
| 44941.145833333336 | 6.98 |
| 44941.15625 | 6.39 |
| 44941.166666666664 | 6.27 |
| 44941.177083333336 | 6.17 |
| 44941.1875 | 6.55 |
| 44941.197916666664 | 6.71 |
| 44941.208333333336 | 6.43 |
| 44941.21875 | 6.67 |
| 44941.229166666664 | 6.4 |
| 44941.239583333336 | 6.77 |
| 44941.25 | 6.56 |
| 44941.260416666664 | 6.68 |
| 44941.270833333336 | 6.65 |
| 44941.28125 | 6.69 |
| 44941.291666666664 | 6.47 |
| 44941.302083333336 | 6.88 |
| 44941.3125 | 6.41 |
| 44941.322916666664 | 6.64 |
| 44941.333333333336 | 6.3 |
| 44941.34375 | 6.56 |
| 44941.354166666664 | 6.59 |
| 44941.364583333336 | 6.41 |
| 44941.375 | 6.33 |
| 44941.385416666664 | 5.84 |
| 44941.395833333336 | 6 |
| 44941.40625 | 6.11 |
| 44941.416666666664 | 5.78 |
| 44941.427083333336 | 6.18 |
| 44941.4375 | 5.86 |
| 44941.447916666664 | 6.02 |
| 44941.458333333336 | 8.26 |
| 44941.46875 | 6.28 |
| 44941.479166666664 | 6.15 |
| 44941.489583333336 | 9.47 |
| 44941.5 | 8.48 |
| 44941.510416666664 | 10.01 |
| 44941.520833333336 | 8.8 |
| 44941.53125 | 10.67 |
| 44941.541666666664 | 10.44 |
| 44941.552083333336 | 10.5 |
| 44941.5625 | 10.33 |
| 44941.572916666664 | 9.91 |
| 44941.583333333336 | 9.71 |
| 44941.59375 | 9.95 |
| 44941.604166666664 | 9.35 |
| 44941.614583333336 | 8.8 |
| 44941.625 | 8.25 |
| 44941.635416666664 | 8.21 |
| 44941.645833333336 | 7.92 |
| 44941.65625 | 7.35 |
| 44941.666666666664 | 7.31 |
| 44941.677083333336 | 7.37 |
| 44941.6875 | 8.04 |
| 44941.697916666664 | 7.71 |
| 44941.708333333336 | 6.93 |
| 44941.71875 | 7.02 |
| 44941.729166666664 | 7.06 |
| 44941.739583333336 | 7.38 |
| 44941.75 | 7.64 |
| 44941.760416666664 | 7.47 |
| 44941.770833333336 | 7.86 |
| 44941.78125 | 7.35 |
| 44941.791666666664 | 7.33 |
| 44941.802083333336 | 7.31 |
| 44941.8125 | 7.3 |
| 44941.822916666664 | 6.99 |
| 44941.833333333336 | 6.54 |
| 44941.84375 | 6.53 |
| 44941.854166666664 | 6.98 |
| 44941.864583333336 | 6.78 |
| 44941.875 | 6.48 |
| 44941.885416666664 | 6.87 |
| 44941.895833333336 | 6.3 |
| 44941.90625 | 6.28 |
| 44941.916666666664 | 6.73 |
| 44941.927083333336 | 6.48 |
| 44941.9375 | 6.42 |
| 44941.947916666664 | 9.22 |
| 44941.958333333336 | 15.79 |
| 44941.96875 | 7.29 |
| 44941.979166666664 | 7.31 |
| 44941.989583333336 | 7.58 |
| 44942.0 | 7.49 |
| 44942.010416666664 | 7.61 |
| 44942.020833333336 | 7.98 |
| 44942.03125 | 8.27 |
| 44942.041666666664 | 9.48 |
| 44942.052083333336 | 9.64 |
| 44942.0625 | 9.57 |
| 44942.072916666664 | 8.83 |
| 44942.083333333336 | 7.83 |
| 44942.09375 | 7.86 |
| 44942.104166666664 | 7.59 |
| 44942.114583333336 | 7.44 |
| 44942.125 | 7.61 |
| 44942.135416666664 | 7.14 |
| 44942.145833333336 | 7.39 |
| 44942.15625 | 6.97 |
| 44942.166666666664 | 6.94 |
| 44942.177083333336 | 6.6 |
| 44942.1875 | 6.93 |
| 44942.197916666664 | 6.66 |
| 44942.208333333336 | 6.87 |
| 44942.21875 | 6.53 |
| 44942.229166666664 | 6.2 |
| 44942.239583333336 | 6.2 |
| 44942.25 | 5.82 |
| 44942.260416666664 | 5.78 |
| 44942.270833333336 | 5.8 |
| 44942.28125 | 5.62 |
| 44942.291666666664 | 5.8 |
| 44942.302083333336 | 5.69 |
| 44942.3125 | 5.73 |
| 44942.322916666664 | 5.97 |
| 44942.333333333336 | 5.97 |
| 44942.34375 | 6.15 |
| 44942.354166666664 | 6.05 |
| 44942.364583333336 | 16.06 |
| 44942.375 | 6.86 |
| 44942.385416666664 | 28.43 |
| 44942.395833333336 | 35.18 |
| 44942.40625 | 6.44 |
| 44942.416666666664 | 5.72 |
| 44942.427083333336 | 5.83 |
| 44942.4375 | 5.57 |
| 44942.447916666664 | 5.56 |
| 44942.458333333336 | 5.16 |
| 44942.46875 | 5.09 |
| 44942.479166666664 | 5.12 |
| 44942.489583333336 | 4.91 |
| 44942.5 | 5.04 |
| 44942.510416666664 | 4.93 |
| 44942.520833333336 | 5.35 |
| 44942.53125 | 5.37 |
| 44942.541666666664 | 5.15 |
| 44942.552083333336 | 5.67 |
| 44942.5625 | 5.39 |
| 44942.572916666664 | 5.77 |
| 44942.583333333336 | 6.33 |
| 44942.59375 | 6.25 |
| 44942.604166666664 | 6.45 |
| 44942.614583333336 | 6.24 |
| 44942.625 | 6.24 |
| 44942.635416666664 | 6.4 |
| 44942.645833333336 | 6.09 |
| 44942.65625 | 5.95 |
| 44942.666666666664 | 6.23 |
| 44942.677083333336 | 6.09 |
| 44942.6875 | 5.89 |
| 44942.697916666664 | 5.63 |
| 44942.708333333336 | 5.49 |
| 44942.71875 | 5.31 |
| 44942.729166666664 | 5.36 |
| 44942.739583333336 | 5.07 |
| 44942.75 | 4.97 |
| 44942.760416666664 | 5.14 |
| 44942.770833333336 | 5.03 |
| 44942.78125 | 5.18 |
| 44942.791666666664 | 4.87 |
| 44942.802083333336 | 4.79 |
| 44942.8125 | 4.69 |
| 44942.822916666664 | 4.72 |
| 44942.833333333336 | 4.79 |
| 44942.84375 | 4.75 |
| 44942.854166666664 | 4.67 |
| 44942.864583333336 | 4.98 |
| 44942.875 | 5.05 |
| 44942.885416666664 | 4.6 |
| 44942.895833333336 | 4.79 |
| 44942.90625 | 4.5 |
| 44942.916666666664 | 4.64 |
| 44942.927083333336 | 4.8 |
| 44942.9375 | 4.58 |
| 44942.947916666664 | 4.7 |
| 44942.958333333336 | 4.56 |
| 44942.96875 | 4.61 |
| 44942.979166666664 | 4.91 |
| 44942.989583333336 | 4.98 |
| 44943.0 | 5.33 |
| 44943.010416666664 | 5.03 |
| 44943.020833333336 | 5.06 |
| 44943.03125 | 5.19 |
| 44943.041666666664 | 5.38 |
| 44943.052083333336 | 5.93 |
| 44943.0625 | 6.05 |
| 44943.072916666664 | 6.04 |
| 44943.083333333336 | 5.97 |
| 44943.09375 | 6.05 |
| 44943.104166666664 | 5.6 |
| 44943.114583333336 | 5.87 |
| 44943.125 | 5.2 |
| 44943.135416666664 | 5.27 |
| 44943.145833333336 | 5.29 |
| 44943.15625 | 5.24 |
| 44943.166666666664 | 5.35 |
| 44943.177083333336 | 4.99 |
| 44943.1875 | 5.01 |
| 44943.197916666664 | 4.98 |
| 44943.208333333336 | 4.87 |
| 44943.21875 | 4.59 |
| 44943.229166666664 | 4.57 |
| 44943.239583333336 | 4.63 |
| 44943.25 | 4.53 |
| 44943.260416666664 | 4.55 |
| 44943.270833333336 | 4.41 |
| 44943.28125 | 4.26 |
| 44943.291666666664 | 4.32 |
| 44943.302083333336 | 4.21 |
| 44943.3125 | 4.28 |
| 44943.322916666664 | 4.11 |
| 44943.333333333336 | 4.24 |
| 44943.34375 | 3.99 |
| 44943.354166666664 | 4.16 |
| 44943.364583333336 | 4.1 |
| 44943.375 | 4.07 |
| 44943.385416666664 | 4.51 |
| 44943.395833333336 | 4.23 |
| 44943.40625 | 3.98 |
| 44943.416666666664 | 4.16 |
| 44943.427083333336 | 4.34 |
| 44943.4375 | 4.14 |
| 44943.447916666664 | 4.26 |
| 44943.458333333336 | 4.22 |
| 44943.46875 | 4.22 |
| 44943.479166666664 | 4.35 |
| 44943.489583333336 | 4.42 |
| 44943.5 | 4.23 |
| 44943.510416666664 | 4.41 |
| 44943.520833333336 | 4.32 |
| 44943.53125 | 4.77 |
| 44943.541666666664 | 4.66 |
| 44943.552083333336 | 5.54 |
| 44943.5625 | 5.53 |
| 44943.572916666664 | 5.53 |
| 44943.583333333336 | 5.53 |
| 44943.59375 | 5.57 |
| 44943.604166666664 | 5.79 |
| 44943.614583333336 | 5.8 |
| 44943.625 | 5.79 |
| 44943.635416666664 | 5.84 |
| 44943.645833333336 | 5.71 |
| 44943.65625 | 5.57 |
| 44943.666666666664 | 6.19 |
| 44943.677083333336 | 5.7 |
| 44943.6875 | 5.77 |
| 44943.697916666664 | 5.29 |
| 44943.708333333336 | 5.65 |
| 44943.71875 | 5.25 |
| 44943.729166666664 | 5.71 |
| 44943.739583333336 | 5.19 |
| 44943.75 | 5.03 |
| 44943.760416666664 | 4.89 |
| 44943.770833333336 | 4.65 |
| 44943.78125 | 4.44 |
| 44943.791666666664 | 4.34 |
| 44943.802083333336 | 4.12 |
| 44943.8125 | 4.12 |
| 44943.822916666664 | 3.99 |
| 44943.833333333336 | 4.01 |
| 44943.84375 | 4.08 |
| 44943.854166666664 | 3.88 |
| 44943.864583333336 | 3.75 |
| 44943.875 | 4.07 |
| 44943.885416666664 | 3.84 |
| 44943.895833333336 | 3.96 |
| 44943.90625 | 4.01 |
| 44943.916666666664 | 4 |
| 44943.927083333336 | 3.89 |
| 44943.9375 | 3.83 |
| 44943.947916666664 | 3.82 |
| 44943.958333333336 | 3.94 |
| 44943.96875 | 3.84 |
| 44943.979166666664 | 4.03 |
| 44943.989583333336 | 4.11 |
| 44944.0 | 4.4 |
| 44944.010416666664 | 4.47 |
| 44944.020833333336 | 4.38 |
| 44944.03125 | 4.68 |
| 44944.041666666664 | 5.2 |
| 44944.052083333336 | 5.56 |
| 44944.0625 | 5.51 |
| 44944.072916666664 | 5.58 |
| 44944.083333333336 | 5.65 |
| 44944.09375 | 5.74 |
| 44944.104166666664 | 5.79 |
| 44944.114583333336 | 34.89 |
| 44944.125 | 15.23 |
| 44944.135416666664 | 5.45 |
| 44944.145833333336 | 5.59 |
| 44944.15625 | 5.13 |
| 44944.166666666664 | 5.42 |
| 44944.177083333336 | 5.33 |
| 44944.1875 | 5.67 |
| 44944.197916666664 | 5.15 |
| 44944.208333333336 | 5.04 |
| 44944.21875 | 5.17 |
| 44944.229166666664 | 5.15 |
| 44944.239583333336 | 5.27 |
| 44944.25 | 6.45 |
| 44944.260416666664 | 5.85 |
| 44944.270833333336 | 4.87 |
| 44944.28125 | 5.07 |
| 44944.291666666664 | 5.37 |
| 44944.302083333336 | 5.23 |
| 44944.3125 | 5.14 |
| 44944.322916666664 | 5.13 |
| 44944.333333333336 | 4.78 |
| 44944.34375 | 4.72 |
| 44944.354166666664 | 4.59 |
| 44944.364583333336 | 4.46 |
| 44944.375 | 4.59 |
| 44944.385416666664 | 4.24 |
| 44944.395833333336 | 4.24 |
| 44944.40625 | 4.41 |
| 44944.416666666664 | 4.09 |
| 44944.427083333336 | 4.32 |
| 44944.4375 | 4.38 |
| 44944.447916666664 | 4.29 |
| 44944.458333333336 | 4.96 |
| 44944.46875 | 4.36 |
| 44944.479166666664 | 4.83 |
| 44944.489583333336 | 4.75 |
| 44944.5 | 5.32 |
| 44944.510416666664 | 5.56 |
| 44944.520833333336 | 5.26 |
| 44944.53125 | 5.33 |
| 44944.541666666664 | 5.02 |
| 44944.552083333336 | 6.64 |
| 44944.5625 | 7.68 |
| 44944.572916666664 | 44.93 |
| 44944.583333333336 | 10.29 |
| 44944.59375 | 18.95 |
| 44944.604166666664 | 21.29 |
| 44944.614583333336 | 19.87 |
| 44944.625 | 16.38 |
| 44944.635416666664 | 14.86 |
| 44944.645833333336 | 15.37 |
| 44944.65625 | 10.8 |
| 44944.666666666664 | 9.68 |
| 44944.677083333336 | 9.61 |
| 44944.6875 | 8.83 |
| 44944.697916666664 | 11.57 |
| 44944.708333333336 | 6.71 |
| 44944.71875 | 6.71 |
| 44944.729166666664 | 6.37 |
| 44944.739583333336 | 5.96 |
| 44944.75 | 5.64 |
| 44944.760416666664 | 5.45 |
| 44944.770833333336 | 5.57 |
| 44944.78125 | 5.4 |
| 44944.791666666664 | 5.04 |
| 44944.802083333336 | 5.06 |
| 44944.8125 | 4.48 |
| 44944.822916666664 | 4.2 |
| 44944.833333333336 | 4.07 |
| 44944.84375 | 4.07 |
| 44944.854166666664 | 4.24 |
| 44944.864583333336 | 4.07 |
| 44944.875 | 3.93 |
| 44944.885416666664 | 3.86 |
| 44944.895833333336 | 3.76 |
| 44944.90625 | 3.78 |
| 44944.916666666664 | 3.73 |
| 44944.927083333336 | 3.69 |
| 44944.9375 | 3.51 |
| 44944.947916666664 | 3.75 |
| 44944.958333333336 | 3.61 |
| 44944.96875 | 3.73 |
| 44944.979166666664 | 3.58 |
| 44944.989583333336 | 3.47 |
| 44945.0 | 3.69 |
| 44945.010416666664 | 4.21 |
| 44945.020833333336 | 4.4 |
| 44945.03125 | 4.41 |
| 44945.041666666664 | 5.51 |
| 44945.052083333336 | 6.02 |
| 44945.0625 | 6.07 |
| 44945.072916666664 | 9.24 |
| 44945.083333333336 | 7.25 |
| 44945.09375 | 6.68 |
| 44945.104166666664 | 6.2 |
| 44945.114583333336 | 5.93 |
| 44945.125 | 5.96 |
| 44945.135416666664 | 6.01 |
| 44945.145833333336 | 6.06 |
| 44945.15625 | 6.37 |
| 44945.166666666664 | 6.13 |
| 44945.177083333336 | 5.95 |
| 44945.1875 | 5.35 |
| 44945.197916666664 | 5.21 |
| 44945.208333333336 | 5.28 |
| 44945.21875 | 5.36 |
| 44945.229166666664 | 5.05 |
| 44945.239583333336 | 4.68 |
| 44945.25 | 4.9 |
| 44945.260416666664 | 4.85 |
| 44945.270833333336 | 4.45 |
| 44945.28125 | 4.17 |
| 44945.291666666664 | 3.87 |
| 44945.302083333336 | 3.61 |
| 44945.3125 | 3.57 |
| 44945.322916666664 | 3.42 |
| 44945.333333333336 | 3.57 |
| 44945.34375 | 3.47 |
| 44945.354166666664 | 3.52 |
| 44945.364583333336 | 3.77 |
| 44945.375 | 3.98 |
| 44945.385416666664 | 3.91 |
| 44945.395833333336 | 3.86 |
| 44945.40625 | 3.82 |
| 44945.416666666664 | 3.61 |
| 44945.427083333336 | 3.58 |
| 44945.4375 | 3.33 |
| 44945.447916666664 | 3.47 |
| 44945.458333333336 | 3.43 |
| 44945.46875 | 3.58 |
| 44945.479166666664 | 10.31 |
| 44945.489583333336 | 4.68 |
| 44945.5 | 3.26 |
| 44945.510416666664 | 3.18 |
| 44945.520833333336 | 3.49 |
| 44945.53125 | 3.09 |
| 44945.541666666664 | 3.22 |
| 44945.552083333336 | 3.69 |
| 44945.5625 | 3.54 |
| 44945.572916666664 | 3.72 |
| 44945.583333333336 | 4.12 |
| 44945.59375 | 4.24 |
| 44945.604166666664 | 4.43 |
| 44945.614583333336 | 4.57 |
| 44945.625 | 5.02 |
| 44945.635416666664 | 5.61 |
| 44945.645833333336 | 5.62 |
| 44945.65625 | 6.74 |
| 44945.666666666664 | 6.36 |
| 44945.677083333336 | 6.5 |
| 44945.6875 | 6.59 |
| 44945.697916666664 | 6.4 |
| 44945.708333333336 | 6.49 |
| 44945.71875 | 6.47 |
| 44945.729166666664 | 6.14 |
| 44945.739583333336 | 5.74 |
| 44945.75 | 5.57 |
| 44945.760416666664 | 5.57 |
| 44945.770833333336 | 5.36 |
| 44945.78125 | 4.93 |
| 44945.791666666664 | 5.02 |
| 44945.802083333336 | 4.78 |
| 44945.8125 | 4.84 |
| 44945.822916666664 | 4.67 |
| 44945.833333333336 | 4.47 |
| 44945.84375 | 4.42 |
| 44945.854166666664 | 4.35 |
| 44945.864583333336 | 4.26 |
| 44945.875 | 4.29 |
| 44945.885416666664 | 4.32 |
| 44945.895833333336 | 4.47 |
| 44945.90625 | 4.15 |
| 44945.916666666664 | 3.95 |
| 44945.927083333336 | 3.78 |
| 44945.9375 | 3.6 |
| 44945.947916666664 | 3.68 |
| 44945.958333333336 | 3.58 |
| 44945.96875 | 3.53 |
| 44945.979166666664 | 3.6 |
| 44945.989583333336 | 3.49 |
| 44946.0 | 3.31 |
| 44946.010416666664 | 3.34 |
| 44946.020833333336 | 3.38 |
| 44946.03125 | 3.71 |
| 44946.041666666664 | 3.51 |
| 44946.052083333336 | 3.87 |
| 44946.0625 | 4.58 |
| 44946.072916666664 | 4.72 |
| 44946.083333333336 | 4.97 |
| 44946.09375 | 5.42 |
| 44946.104166666664 | 6.45 |
| 44946.114583333336 | 7.8 |
| 44946.125 | 7.56 |
| 44946.135416666664 | 8.16 |
| 44946.145833333336 | 7.89 |
| 44946.15625 | 7.86 |
| 44946.166666666664 | 7.78 |
| 44946.177083333336 | 7.98 |
| 44946.1875 | 8.06 |
| 44946.197916666664 | 7.69 |
| 44946.208333333336 | 8.02 |
| 44946.21875 | 7.1 |
| 44946.229166666664 | 7.29 |
| 44946.239583333336 | 6.41 |
| 44946.25 | 6.28 |
| 44946.260416666664 | 6.32 |
| 44946.270833333336 | 6.2 |
| 44946.28125 | 6.17 |
| 44946.291666666664 | 6.06 |
| 44946.302083333336 | 6.22 |
| 44946.3125 | 6.16 |
| 44946.322916666664 | 5.59 |
| 44946.333333333336 | 5.56 |
| 44946.34375 | 4.87 |
| 44946.354166666664 | 4.77 |
| 44946.364583333336 | 4.89 |
| 44946.375 | 5 |
| 44946.385416666664 | 5.26 |
| 44946.395833333336 | 5.42 |
| 44946.40625 | 5.16 |
| 44946.416666666664 | 5.65 |
| 44946.427083333336 | 5.85 |
| 44946.4375 | 4.82 |
| 44946.447916666664 | 4.52 |
| 44946.458333333336 | 4.48 |
| 44946.46875 | 4.16 |
| 44946.479166666664 | 4.1 |
| 44946.489583333336 | 4.2 |
| 44946.5 | 5.77 |
| 44946.510416666664 | 5.36 |
| 44946.520833333336 | 4.57 |
| 44946.53125 | 3.88 |
| 44946.541666666664 | 3.63 |
| 44946.552083333336 | 3.47 |
| 44946.5625 | 3.36 |
| 44946.572916666664 | 3.34 |
| 44946.583333333336 | 3.43 |
| 44946.59375 | 3.72 |
| 44946.604166666664 | 4.17 |
| 44946.614583333336 | 4.14 |
| 44946.625 | 4.71 |
| 44946.635416666664 | 6.03 |
| 44946.645833333336 | 6.17 |
| 44946.65625 | 9.39 |
| 44946.666666666664 | 10.36 |
| 44946.677083333336 | 65.26 |
| 44946.6875 | 18.43 |
| 44946.697916666664 | 28.95 |
| 44946.708333333336 | 33.49 |
| 44946.71875 | 92.03 |
| 44946.729166666664 | 20.43 |
| 44946.739583333336 | 17.88 |
| 44946.75 | 16.44 |
| 44946.760416666664 | 15.9 |
| 44946.770833333336 | 7.82 |
| 44946.78125 | 7.4 |
| 44946.791666666664 | 7.45 |
| 44946.802083333336 | 6.82 |
| 44946.8125 | 6.78 |
| 44946.822916666664 | 6.31 |
| 44946.833333333336 | 6.26 |
| 44946.84375 | 5.67 |
| 44946.854166666664 | 5.26 |
| 44946.864583333336 | 4.96 |
| 44946.875 | 4.98 |
| 44946.885416666664 | 4.69 |
| 44946.895833333336 | 4.39 |
| 44946.90625 | 4.28 |
| 44946.916666666664 | 4.33 |
| 44946.927083333336 | 4.46 |
| 44946.9375 | 4.5 |
| 44946.947916666664 | 4.57 |
| 44946.958333333336 | 4.47 |
| 44946.96875 | 4.34 |
| 44946.979166666664 | 4.04 |
| 44946.989583333336 | 3.79 |
| 44947.0 | 3.61 |
| 44947.010416666664 | 3.84 |
| 44947.020833333336 | 3.67 |
| 44947.03125 | 3.47 |
| 44947.041666666664 | 3.49 |
| 44947.052083333336 | 3.33 |
| 44947.0625 | 3.5 |
| 44947.072916666664 | 4.2 |
| 44947.083333333336 | 4.51 |
| 44947.09375 | 5.3 |
| 44947.104166666664 | 6.08 |
| 44947.114583333336 | 7.28 |
| 44947.125 | 7.96 |
| 44947.135416666664 | 9.15 |
| 44947.145833333336 | 8.48 |
| 44947.15625 | 9.07 |
| 44947.166666666664 | 11.01 |
| 44947.177083333336 | 11.36 |
| 44947.1875 | 10.98 |
| 44947.197916666664 | 10.75 |
| 44947.208333333336 | 10.95 |
| 44947.21875 | 11.82 |
| 44947.229166666664 | 12.02 |
| 44947.239583333336 | 12.19 |
| 44947.25 | 10.7 |
| 44947.260416666664 | 10.19 |
| 44947.270833333336 | 9.79 |
| 44947.28125 | 8.67 |
| 44947.291666666664 | 8.09 |
| 44947.302083333336 | 8.9 |
| 44947.3125 | 8.54 |
| 44947.322916666664 | 8.59 |
| 44947.333333333336 | 9.57 |
| 44947.34375 | 10.41 |
| 44947.354166666664 | 10.12 |
| 44947.364583333336 | 12.13 |
| 44947.375 | 11.68 |
| 44947.385416666664 | 9.69 |
| 44947.395833333336 | 8.72 |
| 44947.40625 | 9.16 |
| 44947.416666666664 | 10.2 |
| 44947.427083333336 | 10.61 |
| 44947.4375 | 9.59 |
| 44947.447916666664 | 9.33 |
| 44947.458333333336 | 8.82 |
| 44947.46875 | 7.72 |
| 44947.479166666664 | 7.39 |
| 44947.489583333336 | 8.4 |
| 44947.5 | 8.3 |
| 44947.510416666664 | 7.34 |
| 44947.520833333336 | 7.36 |
| 44947.53125 | 7.01 |
| 44947.541666666664 | 6.69 |
| 44947.552083333336 | 6.44 |
| 44947.5625 | 6.12 |
| 44947.572916666664 | 5.79 |
| 44947.583333333336 | 5.37 |
| 44947.59375 | 5.09 |
| 44947.604166666664 | 4.8 |
| 44947.614583333336 | 5.06 |
| 44947.625 | 5.13 |
| 44947.635416666664 | 4.95 |
| 44947.645833333336 | 5.34 |
| 44947.65625 | 5.25 |
| 44947.666666666664 | 6.28 |
| 44947.677083333336 | 6.5 |
| 44947.6875 | 6.74 |
| 44947.697916666664 | 9.03 |
| 44947.708333333336 | 11.08 |
| 44947.71875 | 11.27 |
| 44947.729166666664 | 12.18 |
| 44947.739583333336 | 16.23 |
| 44947.75 | 14.94 |
| 44947.760416666664 | 15.32 |
| 44947.770833333336 | 12.49 |
| 44947.78125 | 12.21 |
| 44947.791666666664 | 11.47 |
| 44947.802083333336 | 11.56 |
| 44947.8125 | 9.99 |
| 44947.822916666664 | 8.54 |
| 44947.833333333336 | 8.57 |
| 44947.84375 | 8.43 |
| 44947.854166666664 | 8.22 |
| 44947.864583333336 | 7.79 |
| 44947.875 | 7.79 |
| 44947.885416666664 | 7.64 |
| 44947.895833333336 | 7.87 |
| 44947.90625 | 7.6 |
| 44947.916666666664 | 6.74 |
| 44947.927083333336 | 6.2 |
| 44947.9375 | 5.96 |
| 44947.947916666664 | 6.2 |
| 44947.958333333336 | 6.34 |
| 44947.96875 | 6.74 |
| 44947.979166666664 | 6.2 |
| 44947.989583333336 | 5.93 |
| 44948.0 | 5.57 |
| 44948.010416666664 | 4.98 |
| 44948.020833333336 | 4.82 |
| 44948.03125 | 5.02 |
| 44948.041666666664 | 4.71 |
| 44948.052083333336 | 4.43 |
| 44948.0625 | 4.57 |
| 44948.072916666664 | 4.45 |
| 44948.083333333336 | 4.36 |
| 44948.09375 | 4.04 |
| 44948.104166666664 | 4.27 |
| 44948.114583333336 | 4.03 |
| 44948.125 | 4.47 |
| 44948.135416666664 | 4.41 |
| 44948.145833333336 | 4.81 |
| 44948.15625 | 4.97 |
| 44948.166666666664 | 29.88 |
| 44948.177083333336 | 32.42 |
| 44948.1875 | 5.45 |
| 44948.197916666664 | 5.88 |
| 44948.208333333336 | 6.87 |
| 44948.21875 | 9.29 |
| 44948.229166666664 | 10.84 |
| 44948.239583333336 | 10.87 |
| 44948.25 | 11.32 |
| 44948.260416666664 | 11.93 |
| 44948.270833333336 | 10.71 |
| 44948.28125 | 10.87 |
| 44948.291666666664 | 9.58 |
| 44948.302083333336 | 9.28 |
| 44948.3125 | 9.23 |
| 44948.322916666664 | 8.24 |
| 44948.333333333336 | 7.96 |
| 44948.34375 | 8.67 |
| 44948.354166666664 | 8.5 |
| 44948.364583333336 | 8.07 |
| 44948.375 | 8.52 |
| 44948.385416666664 | 7.65 |
| 44948.395833333336 | 6.85 |
| 44948.40625 | 6.26 |
| 44948.416666666664 | 5.92 |
| 44948.427083333336 | 5.6 |
| 44948.4375 | 5.46 |
| 44948.447916666664 | 5.65 |
| 44948.458333333336 | 5.71 |
| 44948.46875 | 5.83 |
| 44948.479166666664 | 5.82 |
| 44948.489583333336 | 5.7 |
| 44948.5 | 5.75 |
| 44948.510416666664 | 5.79 |
| 44948.520833333336 | 5.55 |
| 44948.53125 | 5.44 |
| 44948.541666666664 | 5.2 |
| 44948.552083333336 | 5.37 |
| 44948.5625 | 5.2 |
| 44948.572916666664 | 5.35 |
| 44948.583333333336 | 4.87 |
| 44948.59375 | 4.76 |
| 44948.604166666664 | 4.67 |
| 44948.614583333336 | 4.3 |
| 44948.625 | 4.27 |
| 44948.635416666664 | 4.19 |
| 44948.645833333336 | 3.98 |
| 44948.65625 | 3.86 |
| 44948.666666666664 | 3.73 |
| 44948.677083333336 | 3.79 |
| 44948.6875 | 4.02 |
| 44948.697916666664 | 4.41 |
| 44948.708333333336 | 4.73 |
| 44948.71875 | 5.8 |
| 44948.729166666664 | 4.89 |
| 44948.739583333336 | 6.23 |
| 44948.75 | 7.3 |
| 44948.760416666664 | 7.52 |
| 44948.770833333336 | 12.84 |
| 44948.78125 | 18.98 |
| 44948.791666666664 | 18.02 |
| 44948.802083333336 | 18.08 |
| 44948.8125 | 17.27 |
| 44948.822916666664 | 17.18 |
| 44948.833333333336 | 15.09 |
| 44948.84375 | 14.77 |
| 44948.854166666664 | 12.76 |
| 44948.864583333336 | 10.86 |
| 44948.875 | 11 |
| 44948.885416666664 | 11.19 |
| 44948.895833333336 | 10.33 |
| 44948.90625 | 10.79 |
| 44948.916666666664 | 10.03 |
| 44948.927083333336 | 9.44 |
| 44948.9375 | 8.15 |
| 44948.947916666664 | 7.41 |
| 44948.958333333336 | 7.23 |
| 44948.96875 | 6.73 |
| 44948.979166666664 | 6.85 |
| 44948.989583333336 | 6.21 |
| 44949.0 | 5.86 |
| 44949.010416666664 | 5.76 |
| 44949.020833333336 | 5.67 |
| 44949.03125 | 5.17 |
| 44949.041666666664 | 5.16 |
| 44949.052083333336 | 4.84 |
| 44949.0625 | 4.47 |
| 44949.072916666664 | 4.63 |
| 44949.083333333336 | 4.44 |
| 44949.09375 | 4.43 |
| 44949.104166666664 | 4.44 |
| 44949.114583333336 | 4.37 |
| 44949.125 | 4.27 |
| 44949.135416666664 | 4.19 |
| 44949.145833333336 | 3.98 |
| 44949.15625 | 4.08 |
| 44949.166666666664 | 4.32 |
| 44949.177083333336 | 5.33 |
| 44949.1875 | 5.07 |
| 44949.197916666664 | 5.42 |
| 44949.208333333336 | 7.15 |
| 44949.21875 | 7.77 |
| 44949.229166666664 | 9.32 |
| 44949.239583333336 | 12.77 |
| 44949.25 | 14.89 |
| 44949.260416666664 | 17.44 |
| 44949.270833333336 | 15.92 |
| 44949.28125 | 15.74 |
| 44949.291666666664 | 15.95 |
| 44949.302083333336 | 15.01 |
| 44949.3125 | 14.03 |
| 44949.322916666664 | 13.94 |
| 44949.333333333336 | 12.15 |
| 44949.34375 | 10.52 |
| 44949.354166666664 | 9.92 |
| 44949.364583333336 | 9.57 |
| 44949.375 | 9.71 |
| 44949.385416666664 | 9.53 |
| 44949.395833333336 | 8.95 |
| 44949.40625 | 8.76 |
| 44949.416666666664 | 8.46 |
| 44949.427083333336 | 7.57 |
| 44949.4375 | 7.03 |
| 44949.447916666664 | 6.41 |
| 44949.458333333336 | 6.34 |
| 44949.46875 | 6.61 |
| 44949.479166666664 | 6.3 |
| 44949.489583333336 | 6.41 |
| 44949.5 | 7.21 |
| 44949.510416666664 | 7.03 |
| 44949.520833333336 | 6.53 |
| 44949.53125 | 6.19 |
| 44949.541666666664 | 5.78 |
| 44949.552083333336 | 5.76 |
| 44949.5625 | 5.35 |
| 44949.572916666664 | 5.43 |
| 44949.583333333336 | 5.27 |
| 44949.59375 | 5.02 |
| 44949.604166666664 | 5.25 |
| 44949.614583333336 | 4.76 |
| 44949.625 | 4.91 |
| 44949.635416666664 | 4.53 |
| 44949.645833333336 | 4.62 |
| 44949.65625 | 4.29 |
| 44949.666666666664 | 4.24 |
| 44949.677083333336 | 4.29 |
| 44949.6875 | 4.29 |
| 44949.697916666664 | 4.49 |
| 44949.708333333336 | 4.62 |
| 44949.71875 | 5 |
| 44949.729166666664 | 5.26 |
| 44949.739583333336 | 10.12 |
| 44949.75 | 6.6 |
| 44949.760416666664 | 106.63 |
| 44949.770833333336 | 12.71 |
| 44949.78125 | 15.62 |
| 44949.791666666664 | 32.73 |
| 44949.802083333336 | 45.03 |
| 44949.8125 | 67.18 |
| 44949.822916666664 | 42.07 |
| 44949.833333333336 | 54.79 |
| 44949.84375 | 104.51 |
| 44949.854166666664 | 44.96 |
| 44949.864583333336 | 44.8 |
| 44949.875 | 19.07 |
| 44949.885416666664 | 16.18 |
| 44949.895833333336 | 13.64 |
| 44949.90625 | 13.05 |
| 44949.916666666664 | 15.14 |
| 44949.927083333336 | 15.08 |
| 44949.9375 | 14.92 |
| 44949.947916666664 | 14.64 |
| 44949.958333333336 | 13.22 |
| 44949.96875 | 11.42 |
| 44949.979166666664 | 11.68 |
| 44949.989583333336 | 10.92 |
| 44950.0 | 9.56 |
| 44950.010416666664 | 8.87 |
| 44950.020833333336 | 8.98 |
| 44950.03125 | 8.91 |
| 44950.041666666664 | 8.79 |
| 44950.052083333336 | 9 |
| 44950.0625 | 8.98 |
| 44950.072916666664 | 8.72 |
| 44950.083333333336 | 8.25 |
| 44950.09375 | 8.01 |
| 44950.104166666664 | 7.52 |
| 44950.114583333336 | 6.92 |
| 44950.125 | 6.67 |
| 44950.135416666664 | 6.38 |
| 44950.145833333336 | 6.11 |
| 44950.15625 | 5.82 |
| 44950.166666666664 | 5.69 |
| 44950.177083333336 | 6.33 |
| 44950.1875 | 8.91 |
| 44950.197916666664 | 9.12 |
| 44950.208333333336 | 8.45 |
| 44950.21875 | 10.12 |
| 44950.229166666664 | 10.94 |
| 44950.239583333336 | 12.58 |
| 44950.25 | 12.92 |
| 44950.260416666664 | 14.42 |
| 44950.270833333336 | 13.96 |
| 44950.28125 | 12.27 |
| 44950.291666666664 | 12.06 |
| 44950.302083333336 | 11.36 |
| 44950.3125 | 11.97 |
| 44950.322916666664 | 12.16 |
| 44950.333333333336 | 12.43 |
| 44950.34375 | 13.37 |
| 44950.354166666664 | 12.36 |
| 44950.364583333336 | 12.66 |
| 44950.375 | 11.69 |
| 44950.385416666664 | 11.58 |
| 44950.395833333336 | 9.87 |
| 44950.40625 | 10.24 |
| 44950.416666666664 | 11.85 |
| 44950.427083333336 | 11.42 |
| 44950.4375 | 11.65 |
| 44950.447916666664 | 12.04 |
| 44950.458333333336 | 11.54 |
| 44950.46875 | 9.53 |
| 44950.479166666664 | 8.94 |
| 44950.489583333336 | 8.95 |
| 44950.5 | 7.73 |
| 44950.510416666664 | 7.77 |
| 44950.520833333336 | 7.61 |
| 44950.53125 | 7.8 |
| 44950.541666666664 | 7.56 |
| 44950.552083333336 | 7.24 |
| 44950.5625 | 6.45 |
| 44950.572916666664 | 6.27 |
| 44950.583333333336 | 6.07 |
| 44950.59375 | 5.77 |
| 44950.604166666664 | 5.91 |
| 44950.614583333336 | 5.87 |
| 44950.625 | 5.98 |
| 44950.635416666664 | 5.71 |
| 44950.645833333336 | 6.08 |
| 44950.65625 | 6.26 |
| 44950.666666666664 | 5.14 |
| 44950.677083333336 | 5.3 |
| 44950.6875 | 5.05 |
| 44950.697916666664 | 5.24 |
| 44950.708333333336 | 5.09 |
| 44950.71875 | 5.18 |
| 44950.729166666664 | 5 |
| 44950.739583333336 | 5.67 |
| 44950.75 | 6.18 |
| 44950.760416666664 | 6.14 |
| 44950.770833333336 | 6.44 |
| 44950.78125 | 8 |
| 44950.791666666664 | 8.18 |
| 44950.802083333336 | 57.04 |
| 44950.8125 | 15.54 |
| 44950.822916666664 | 11.17 |
| 44950.833333333336 | 12.99 |
| 44950.84375 | 12.53 |
| 44950.854166666664 | 13.58 |
| 44950.864583333336 | 13.69 |
| 44950.875 | 14 |
| 44950.885416666664 | 13.53 |
| 44950.895833333336 | 12.74 |
| 44950.90625 | 11.31 |
| 44950.916666666664 | 10.81 |
| 44950.927083333336 | 9.64 |
| 44950.9375 | 10.18 |
| 44950.947916666664 | 11.12 |
| 44950.958333333336 | 11.86 |
| 44950.96875 | 13.22 |
| 44950.979166666664 | 15.62 |
| 44950.989583333336 | 14.44 |
| 44951.0 | 11.56 |
| 44951.010416666664 | 11.84 |
| 44951.020833333336 | 10.52 |
| 44951.03125 | 10.27 |
| 44951.041666666664 | 8.4 |
| 44951.052083333336 | 7.17 |
| 44951.0625 | 6.6 |
| 44951.072916666664 | 6.13 |
| 44951.083333333336 | 6.09 |
| 44951.09375 | 5.96 |
| 44951.104166666664 | 5.94 |
| 44951.114583333336 | 6.07 |
| 44951.125 | 5.78 |
| 44951.135416666664 | 5.4 |
| 44951.145833333336 | 5.14 |
| 44951.15625 | 4.74 |
| 44951.166666666664 | 4.6 |
| 44951.177083333336 | 4.94 |
| 44951.1875 | 4.65 |
| 44951.197916666664 | 4.37 |
| 44951.208333333336 | 4.86 |
| 44951.21875 | 4.6 |
| 44951.229166666664 | 5.89 |
| 44951.239583333336 | 6.16 |
| 44951.25 | 5.5 |
| 44951.260416666664 | 7.05 |
| 44951.270833333336 | 9.9 |
| 44951.28125 | 9.65 |
| 44951.291666666664 | 11.46 |
| 44951.302083333336 | 11.83 |
| 44951.3125 | 11.89 |
| 44951.322916666664 | 10.88 |
| 44951.333333333336 | 10.99 |
| 44951.34375 | 10.19 |
| 44951.354166666664 | 10.4 |
| 44951.364583333336 | 10.38 |
| 44951.375 | 10.19 |
| 44951.385416666664 | 9.91 |
| 44951.395833333336 | 9.36 |
| 44951.40625 | 9.59 |
| 44951.416666666664 | 9.18 |
| 44951.427083333336 | 7.97 |
| 44951.4375 | 8.07 |
| 44951.447916666664 | 8.76 |
| 44951.458333333336 | 8.55 |
| 44951.46875 | 8.52 |
| 44951.479166666664 | 9.02 |
| 44951.489583333336 | 10.47 |
| 44951.5 | 9.78 |
| 44951.510416666664 | 9.82 |
| 44951.520833333336 | 9.27 |
| 44951.53125 | 7.66 |
| 44951.541666666664 | 6.76 |
| 44951.552083333336 | 6.27 |
| 44951.5625 | 5.77 |
| 44951.572916666664 | 5.84 |
| 44951.583333333336 | 5.8 |
| 44951.59375 | 5.76 |
| 44951.604166666664 | 5.24 |
| 44951.614583333336 | 4.88 |
| 44951.625 | 7.11 |
| 44951.635416666664 | 5.02 |
| 44951.645833333336 | 4.86 |
| 44951.65625 | 4.73 |
| 44951.666666666664 | 4.5 |
| 44951.677083333336 | 4.27 |
| 44951.6875 | 4.55 |
| 44951.697916666664 | 5.14 |
| 44951.708333333336 | 4.29 |
| 44951.71875 | 4.38 |
| 44951.729166666664 | 4.1 |
| 44951.739583333336 | 4.33 |
| 44951.75 | 4.1 |
| 44951.760416666664 | 4.21 |
| 44951.770833333336 | 4.28 |
| 44951.78125 | 4.4 |
| 44951.791666666664 | 4.66 |
| 44951.802083333336 | 4.69 |
| 44951.8125 | 5.34 |
| 44951.822916666664 | 6.51 |
| 44951.833333333336 | 6.74 |
| 44951.84375 | 7.46 |
| 44951.854166666664 | 8.8 |
| 44951.864583333336 | 10.21 |
| 44951.875 | 11.83 |
| 44951.885416666664 | 13.02 |
| 44951.895833333336 | 14.52 |
| 44951.90625 | 13.85 |
| 44951.916666666664 | 16.65 |
| 44951.927083333336 | 14.78 |
| 44951.9375 | 14.72 |
| 44951.947916666664 | 14.02 |
| 44951.958333333336 | 12.44 |
| 44951.96875 | 14.42 |
| 44951.979166666664 | 13.86 |
| 44951.989583333336 | 13.28 |
| 44952.0 | 16.66 |
| 44952.010416666664 | 23.28 |
| 44952.020833333336 | 27.89 |
| 44952.03125 | 33.24 |
| 44952.041666666664 | 39.9 |
| 44952.052083333336 | 43.7 |
| 44952.0625 | 43.96 |
| 44952.072916666664 | 47.15 |
| 44952.083333333336 | 43.78 |
| 44952.09375 | 40.39 |
| 44952.104166666664 | 40.23 |
| 44952.114583333336 | 36.47 |
| 44952.125 | 38.17 |
| 44952.135416666664 | 27.55 |
| 44952.145833333336 | 36.3 |
| 44952.15625 | 37.75 |
| 44952.166666666664 | 35.9 |
| 44952.177083333336 | 19.05 |
| 44952.1875 | 16.88 |
| 44952.197916666664 | 14.51 |
| 44952.208333333336 | 16.07 |
| 44952.21875 | 11.78 |
| 44952.229166666664 | 10.73 |
| 44952.239583333336 | 10.92 |
| 44952.25 | 10.44 |
| 44952.260416666664 | 11.35 |
| 44952.270833333336 | 13.2 |
| 44952.28125 | 15.42 |
| 44952.291666666664 | 15.65 |
| 44952.302083333336 | 18.03 |
| 44952.3125 | 16.63 |
| 44952.322916666664 | 14.8 |
| 44952.333333333336 | 17.69 |
| 44952.34375 | 17.85 |
| 44952.354166666664 | 21.52 |
| 44952.364583333336 | 23.81 |
| 44952.375 | 25.83 |
| 44952.385416666664 | 25.06 |
| 44952.395833333336 | 26.98 |
| 44952.40625 | 26.59 |
| 44952.416666666664 | 23.39 |
| 44952.427083333336 | 19.8 |
| 44952.4375 | 17.64 |
| 44952.447916666664 | 15.65 |
| 44952.458333333336 | 14.27 |
| 44952.46875 | 13.66 |
| 44952.479166666664 | 13.1 |
| 44952.489583333336 | 15.55 |
| 44952.5 | 16.02 |
| 44952.510416666664 | 16.65 |
| 44952.520833333336 | 19.38 |
| 44952.53125 | 15.52 |
| 44952.541666666664 | 14.96 |
| 44952.552083333336 | 13.25 |
| 44952.5625 | 12.18 |
| 44952.572916666664 | 11.87 |
| 44952.583333333336 | 11.3 |
| 44952.59375 | 11.11 |
| 44952.604166666664 | 11.24 |
| 44952.614583333336 | 11.66 |
| 44952.625 | 11.97 |
| 44952.635416666664 | 12.11 |
| 44952.645833333336 | 11.7 |
| 44952.65625 | 11.01 |
| 44952.666666666664 | 10.12 |
| 44952.677083333336 | 9.16 |
| 44952.6875 | 8.16 |
| 44952.697916666664 | 8 |
| 44952.708333333336 | 7.21 |
| 44952.71875 | 7.38 |
| 44952.729166666664 | 6.6 |
| 44952.739583333336 | 6.67 |
| 44952.75 | 6.75 |
| 44952.760416666664 | 6.15 |
| 44952.770833333336 | 6.15 |
| 44952.78125 | 5.97 |
| 44952.791666666664 | 7.89 |
| 44952.802083333336 | 8.15 |
| 44952.8125 | 7.96 |
| 44952.822916666664 | 8.92 |
| 44952.833333333336 | 9.27 |
| 44952.84375 | 10.44 |
| 44952.854166666664 | 13.23 |
| 44952.864583333336 | 13.81 |
| 44952.875 | 14.34 |
| 44952.885416666664 | 13.52 |
| 44952.895833333336 | 13.77 |
| 44952.90625 | 13.68 |
| 44952.916666666664 | 13.56 |
| 44952.927083333336 | 12.98 |
| 44952.9375 | 12.88 |
| 44952.947916666664 | 12.65 |
| 44952.958333333336 | 179.69 |
| 44952.96875 | 11.91 |
| 44952.979166666664 | 11.69 |
| 44952.989583333336 | 11.62 |
| 44953.0 | 11.51 |
| 44953.010416666664 | 11.34 |
| 44953.020833333336 | 11.48 |
| 44953.03125 | 10.38 |
| 44953.041666666664 | 10.65 |
| 44953.052083333336 | 10.4 |
| 44953.0625 | 9.27 |
| 44953.072916666664 | 8.9 |
| 44953.083333333336 | 8.26 |
| 44953.09375 | 7.65 |
| 44953.104166666664 | 7.86 |
| 44953.114583333336 | 7.47 |
| 44953.125 | 7.14 |
| 44953.135416666664 | 6.99 |
| 44953.145833333336 | 6.88 |
| 44953.15625 | 6.92 |
| 44953.166666666664 | 6.87 |
| 44953.177083333336 | 6.45 |
| 44953.1875 | 5.92 |
| 44953.197916666664 | 5.51 |
| 44953.208333333336 | 5.37 |
| 44953.21875 | 4.42 |
| 44953.229166666664 | 4.37 |
| 44953.239583333336 | 4.57 |
| 44953.25 | 4.51 |
| 44953.260416666664 | 4.16 |
| 44953.270833333336 | 4.09 |
| 44953.28125 | 4.33 |
| 44953.291666666664 | 5.29 |
| 44953.302083333336 | 5.54 |
| 44953.3125 | 5.77 |
| 44953.322916666664 | 6.02 |
| 44953.333333333336 | 6.7 |
| 44953.34375 | 8.07 |
| 44953.354166666664 | 9.52 |
| 44953.364583333336 | 10.04 |
| 44953.375 | 9.14 |
| 44953.385416666664 | 9.11 |
| 44953.395833333336 | 9.25 |
| 44953.40625 | 9.06 |
| 44953.416666666664 | 9.15 |
| 44953.427083333336 | 9.4 |
| 44953.4375 | 9.56 |
| 44953.447916666664 | 10.17 |
| 44953.458333333336 | 10.82 |
| 44953.46875 | 11 |
| 44953.479166666664 | 11.23 |
| 44953.489583333336 | 10.87 |
| 44953.5 | 10.43 |
| 44953.510416666664 | 10.37 |
| 44953.520833333336 | 10.85 |
| 44953.53125 | 11.61 |
| 44953.541666666664 | 13.08 |
| 44953.552083333336 | 11.78 |
| 44953.5625 | 10.95 |
| 44953.572916666664 | 11.51 |
| 44953.583333333336 | 10.36 |
| 44953.59375 | 11.43 |
| 44953.604166666664 | 9.08 |
| 44953.614583333336 | 7.99 |
| 44953.625 | 6.86 |
| 44953.635416666664 | 6.99 |
| 44953.645833333336 | 6.51 |
| 44953.65625 | 5.46 |
| 44953.666666666664 | 5.17 |
| 44953.677083333336 | 5.06 |
| 44953.6875 | 4.8 |
| 44953.697916666664 | 4.28 |
| 44953.708333333336 | 4.24 |
| 44953.71875 | 4.18 |
| 44953.729166666664 | 4.05 |
| 44953.739583333336 | 4 |
| 44953.75 | 3.98 |
| 44953.760416666664 | 3.53 |
| 44953.770833333336 | 3.8 |
| 44953.78125 | 3.7 |
| 44953.791666666664 | 3.43 |
| 44953.802083333336 | 3.5 |
| 44953.8125 | 3.58 |
| 44953.822916666664 | 4.01 |
| 44953.833333333336 | 4.14 |
| 44953.84375 | 4.86 |
| 44953.854166666664 | 4.97 |
| 44953.864583333336 | 6.82 |
| 44953.875 | 7.47 |
| 44953.885416666664 | 8.47 |
| 44953.895833333336 | 8.52 |
| 44953.90625 | 8.4 |
| 44953.916666666664 | 8.3 |
| 44953.927083333336 | 8.71 |
| 44953.9375 | 8.81 |
| 44953.947916666664 | 8.99 |
| 44953.958333333336 | 8.84 |
| 44953.96875 | 9.03 |
| 44953.979166666664 | 9 |
| 44953.989583333336 | 8.75 |
| 44954.0 | 8.45 |
| 44954.010416666664 | 9.01 |
| 44954.020833333336 | 9.49 |
| 44954.03125 | 8.17 |
| 44954.041666666664 | 7.77 |
| 44954.052083333336 | 8.43 |
| 44954.0625 | 7.97 |
| 44954.072916666664 | 8.45 |
| 44954.083333333336 | 8.92 |
| 44954.09375 | 9.48 |
| 44954.104166666664 | 9.08 |
| 44954.114583333336 | 8.98 |
| 44954.125 | 7.89 |
| 44954.135416666664 | 7.5 |
| 44954.145833333336 | 7.1 |
| 44954.15625 | 6.09 |
| 44954.166666666664 | 5.06 |
| 44954.177083333336 | 4.78 |
| 44954.1875 | 4.47 |
| 44954.197916666664 | 4.43 |
| 44954.208333333336 | 4.1 |
| 44954.21875 | 3.82 |
| 44954.229166666664 | 3.8 |
| 44954.239583333336 | 3.84 |
| 44954.25 | 3.61 |
| 44954.260416666664 | 3.45 |
| 44954.270833333336 | 3.72 |
| 44954.28125 | 3.7 |
| 44954.291666666664 | 3.48 |
| 44954.302083333336 | 3.28 |
| 44954.3125 | 3.05 |
| 44954.322916666664 | 3.07 |
| 44954.333333333336 | 3.55 |
| 44954.34375 | 3.96 |
| 44954.354166666664 | 4.08 |
| 44954.364583333336 | 3.97 |
| 44954.375 | 50.51 |
| 44954.385416666664 | 6.58 |
| 44954.395833333336 | 6.41 |
| 44954.40625 | 6.7 |
| 44954.416666666664 | 7.68 |
| 44954.427083333336 | 8 |
| 44954.4375 | 7.8 |
| 44954.447916666664 | 7.84 |
| 44954.458333333336 | 7.98 |
| 44954.46875 | 7.81 |
| 44954.479166666664 | 7.79 |
| 44954.489583333336 | 7.93 |
| 44954.5 | 8.06 |
| 44954.510416666664 | 7.94 |
| 44954.520833333336 | 7.93 |
| 44954.53125 | 8.08 |
| 44954.541666666664 | 8.05 |
| 44954.552083333336 | 8.73 |
| 44954.5625 | 8.01 |
| 44954.572916666664 | 7.65 |
| 44954.583333333336 | 7.08 |
| 44954.59375 | 7.33 |
| 44954.604166666664 | 7.23 |
| 44954.614583333336 | 6.79 |
| 44954.625 | 6.92 |
| 44954.635416666664 | 6.84 |
| 44954.645833333336 | 5.81 |
| 44954.65625 | 5.49 |
| 44954.666666666664 | 5.81 |
| 44954.677083333336 | 4.91 |
| 44954.6875 | 4.49 |
| 44954.697916666664 | 4.22 |
| 44954.708333333336 | 4.12 |
| 44954.71875 | 4.17 |
| 44954.729166666664 | 4.18 |
| 44954.739583333336 | 4.07 |
| 44954.75 | 3.64 |
| 44954.760416666664 | 3.51 |
| 44954.770833333336 | 3.39 |
| 44954.78125 | 3.33 |
| 44954.791666666664 | 3.41 |
| 44954.802083333336 | 3.61 |
| 44954.8125 | 3.36 |
| 44954.822916666664 | 3.14 |
| 44954.833333333336 | 3.09 |
| 44954.84375 | 3.17 |
| 44954.854166666664 | 3.37 |
| 44954.864583333336 | 3.55 |
| 44954.875 | 3.7 |
| 44954.885416666664 | 4.31 |
| 44954.895833333336 | 5.35 |
| 44954.90625 | 6.01 |
| 44954.916666666664 | 6.79 |
| 44954.927083333336 | 6.91 |
| 44954.9375 | 6.9 |
| 44954.947916666664 | 6.62 |
| 44954.958333333336 | 6.46 |
| 44954.96875 | 6.62 |
| 44954.979166666664 | 6.53 |
| 44954.989583333336 | 6.71 |
| 44955.0 | 6.84 |
| 44955.010416666664 | 6.92 |
| 44955.020833333336 | 6.92 |
| 44955.03125 | 6.62 |
| 44955.041666666664 | 6.83 |
| 44955.052083333336 | 6.41 |
| 44955.0625 | 6.65 |
| 44955.072916666664 | 6.31 |
| 44955.083333333336 | 6.36 |
| 44955.09375 | 6.53 |
| 44955.104166666664 | 6.1 |
| 44955.114583333336 | 5.72 |
| 44955.125 | 6.05 |
| 44955.135416666664 | 5.47 |
| 44955.145833333336 | 5.19 |
| 44955.15625 | 4.97 |
| 44955.166666666664 | 4.37 |
| 44955.177083333336 | 4.25 |
| 44955.1875 | 3.79 |
| 44955.197916666664 | 3.48 |
| 44955.208333333336 | 3.35 |
| 44955.21875 | 3.32 |
| 44955.229166666664 | 3.19 |
| 44955.239583333336 | 3.19 |
| 44955.25 | 3 |
| 44955.260416666664 | 3.27 |
| 44955.270833333336 | 3.03 |
| 44955.28125 | 2.99 |
| 44955.291666666664 | 2.83 |
| 44955.302083333336 | 2.78 |
| 44955.3125 | 3 |
| 44955.322916666664 | 2.84 |
| 44955.333333333336 | 2.84 |
| 44955.34375 | 2.72 |
| 44955.354166666664 | 2.5 |
| 44955.364583333336 | 2.72 |
| 44955.375 | 2.6 |
| 44955.385416666664 | 3.01 |
| 44955.395833333336 | 3.12 |
| 44955.40625 | 3.1 |
| 44955.416666666664 | 3.41 |
| 44955.427083333336 | 3.56 |
| 44955.4375 | 3.71 |
| 44955.447916666664 | 4.21 |
| 44955.458333333336 | 4.49 |
| 44955.46875 | 4.83 |
| 44955.479166666664 | 5.01 |
| 44955.489583333336 | 5.22 |
| 44955.5 | 5.39 |
| 44955.510416666664 | 5.43 |
| 44955.520833333336 | 5.64 |
| 44955.53125 | 5.75 |
| 44955.541666666664 | 5.86 |
| 44955.552083333336 | 5.8 |
| 44955.5625 | 5.73 |
| 44955.572916666664 | 5.84 |
| 44955.583333333336 | 5.59 |
| 44955.59375 | 5.67 |
| 44955.604166666664 | 5.92 |
| 44955.614583333336 | 5.43 |
| 44955.625 | 5.27 |
| 44955.635416666664 | 5.57 |
| 44955.645833333336 | 5.32 |
| 44955.65625 | 4.63 |
| 44955.666666666664 | 4.28 |
| 44955.677083333336 | 4.28 |
| 44955.6875 | 3.87 |
| 44955.697916666664 | 3.62 |
| 44955.708333333336 | 3.62 |
| 44955.71875 | 3.79 |
| 44955.729166666664 | 3.69 |
| 44955.739583333336 | 3.45 |
| 44955.75 | 3.28 |
| 44955.760416666664 | 3.15 |
| 44955.770833333336 | 3.06 |
| 44955.78125 | 3.1 |
| 44955.791666666664 | 3.04 |
| 44955.802083333336 | 3.04 |
| 44955.8125 | 3.19 |
| 44955.822916666664 | 3.12 |
| 44955.833333333336 | 3.3 |
| 44955.84375 | 3.04 |
| 44955.854166666664 | 2.96 |
| 44955.864583333336 | 3.16 |
| 44955.875 | 2.86 |
| 44955.885416666664 | 2.96 |
| 44955.895833333336 | 3.07 |
| 44955.90625 | 3.06 |
| 44955.916666666664 | 3.14 |
| 44955.927083333336 | 3.27 |
| 44955.9375 | 3.55 |
| 44955.947916666664 | 3.84 |
| 44955.958333333336 | 4.01 |
| 44955.96875 | 4.1 |
| 44955.979166666664 | 4.21 |
| 44955.989583333336 | 4.46 |
| 44956.0 | 4.93 |
| 44956.010416666664 | 5.06 |
| 44956.020833333336 | 5.19 |
| 44956.03125 | 5.06 |
| 44956.041666666664 | 5.3 |
| 44956.052083333336 | 5.41 |
| 44956.0625 | 5.37 |
| 44956.072916666664 | 5.47 |
| 44956.083333333336 | 5.36 |
| 44956.09375 | 5.36 |
| 44956.104166666664 | 5.09 |
| 44956.114583333336 | 5.1 |
| 44956.125 | 4.95 |
| 44956.135416666664 | 4.71 |
| 44956.145833333336 | 4.65 |
| 44956.15625 | 4.45 |
| 44956.166666666664 | 4.33 |
| 44956.177083333336 | 4.21 |
| 44956.1875 | 3.92 |
| 44956.197916666664 | 3.82 |
| 44956.208333333336 | 3.63 |
| 44956.21875 | 3.43 |
| 44956.229166666664 | 3.41 |
| 44956.239583333336 | 3.33 |
| 44956.25 | 3.31 |
| 44956.260416666664 | 3.19 |
| 44956.270833333336 | 3.1 |
| 44956.28125 | 3.16 |
| 44956.291666666664 | 3.14 |
| 44956.302083333336 | 3.09 |
| 44956.3125 | 2.95 |
| 44956.322916666664 | 2.87 |
| 44956.333333333336 | 2.82 |
| 44956.34375 | 2.81 |
| 44956.354166666664 | 2.78 |
| 44956.364583333336 | 2.95 |
| 44956.375 | 2.71 |
| 44956.385416666664 | 2.69 |
| 44956.395833333336 | 2.67 |
| 44956.40625 | 2.57 |
| 44956.416666666664 | 2.51 |
| 44956.427083333336 | 2.59 |
| 44956.4375 | 2.88 |
| 44956.447916666664 | 3.26 |
| 44956.458333333336 | 3.26 |
| 44956.46875 | 3.4 |
| 44956.479166666664 | 4.01 |
| 44956.489583333336 | 4.52 |
| 44956.5 | 4.94 |
| 44956.510416666664 | 5.56 |
| 44956.520833333336 | 5.9 |
| 44956.53125 | 5.94 |
| 44956.541666666664 | 5.69 |
| 44956.552083333336 | 5.86 |
| 44956.5625 | 5.51 |
| 44956.572916666664 | 5.64 |
| 44956.583333333336 | 5.74 |
| 44956.59375 | 5.66 |
| 44956.604166666664 | 5.67 |
| 44956.614583333336 | 5.61 |
| 44956.625 | 5.49 |
| 44956.635416666664 | 5.16 |
| 44956.645833333336 | 5.17 |
| 44956.65625 | 5.31 |
| 44956.666666666664 | 5.22 |
| 44956.677083333336 | 5.23 |
| 44956.6875 | 5.58 |
| 44956.697916666664 | 4.66 |
| 44956.708333333336 | 4.68 |
| 44956.71875 | 4.34 |
| 44956.729166666664 | 4.03 |
| 44956.739583333336 | 4.04 |
| 44956.75 | 3.84 |
| 44956.760416666664 | 3.63 |
| 44956.770833333336 | 3.58 |
| 44956.78125 | 3.41 |
| 44956.791666666664 | 3.16 |
| 44956.802083333336 | 3.08 |
| 44956.8125 | 2.99 |
| 44956.822916666664 | 2.91 |
| 44956.833333333336 | 2.77 |
| 44956.84375 | 2.98 |
| 44956.854166666664 | 2.91 |
| 44956.864583333336 | 2.78 |
| 44956.875 | 2.78 |
| 44956.885416666664 | 3.09 |
| 44956.895833333336 | 2.81 |
| 44956.90625 | 2.7 |
| 44956.916666666664 | 2.72 |
| 44956.927083333336 | 2.74 |
| 44956.9375 | 2.8 |
| 44956.947916666664 | 2.78 |
| 44956.958333333336 | 3.24 |
| 44956.96875 | 3.15 |
| 44956.979166666664 | 3.24 |
| 44956.989583333336 | 3.41 |
| 44957.0 | 3.71 |
| 44957.010416666664 | 3.93 |
| 44957.020833333336 | 4.28 |
| 44957.03125 | 4.3 |
| 44957.041666666664 | 4.68 |
| 44957.052083333336 | 4.95 |
| 44957.0625 | 5.11 |
| 44957.072916666664 | 5.18 |
| 44957.083333333336 | 5.3 |
| 44957.09375 | 5.18 |
| 44957.104166666664 | 4.93 |
| 44957.114583333336 | 4.89 |
| 44957.125 | 4.83 |
| 44957.135416666664 | 4.68 |
| 44957.145833333336 | 4.65 |
| 44957.15625 | 4.42 |
| 44957.166666666664 | 4.31 |
| 44957.177083333336 | 4.43 |
| 44957.1875 | 4.15 |
| 44957.197916666664 | 3.9 |
| 44957.208333333336 | 3.92 |
| 44957.21875 | 3.64 |
| 44957.229166666664 | 3.67 |
| 44957.239583333336 | 3.41 |
| 44957.25 | 3.21 |
| 44957.260416666664 | 3.18 |
| 44957.270833333336 | 3.11 |
| 44957.28125 | 2.99 |
| 44957.291666666664 | 2.91 |
| 44957.302083333336 | 2.78 |
| 44957.3125 | 2.77 |
| 44957.322916666664 | 2.56 |
| 44957.333333333336 | 2.65 |
| 44957.34375 | 2.5 |
| 44957.354166666664 | 2.52 |
| 44957.364583333336 | 2.55 |
| 44957.375 | 2.45 |
| 44957.385416666664 | 2.44 |
| 44957.395833333336 | 2.46 |
| 44957.40625 | 2.45 |
| 44957.416666666664 | 2.23 |
| 44957.427083333336 | 2.51 |
| 44957.4375 | 2.34 |
| 44957.447916666664 | 2.32 |
| 44957.458333333336 | 2.37 |
| 44957.46875 | 2.67 |
| 44957.479166666664 | 2.71 |
| 44957.489583333336 | 2.95 |
| 44957.5 | 3.9 |
| 44957.510416666664 | 3.79 |
| 44957.520833333336 | 4.07 |
| 44957.53125 | 4.18 |
| 44957.541666666664 | 4.49 |
| 44957.552083333336 | 5.19 |
| 44957.5625 | 5.74 |
| 44957.572916666664 | 5.67 |
| 44957.583333333336 | 6.31 |
| 44957.59375 | 6.04 |
| 44957.604166666664 | 5.98 |
| 44957.614583333336 | 6.2 |
| 44957.625 | 5.9 |
| 44957.635416666664 | 5.5 |
| 44957.645833333336 | 5.33 |
| 44957.65625 | 5.24 |
| 44957.666666666664 | 5.12 |
| 44957.677083333336 | 4.71 |
| 44957.6875 | 4.94 |
| 44957.697916666664 | 5.14 |
| 44957.708333333336 | 5.28 |
| 44957.71875 | 5.11 |
| 44957.729166666664 | 5.26 |
| 44957.739583333336 | 4.84 |
| 44957.75 | 4.66 |
| 44957.760416666664 | 4.53 |
| 44957.770833333336 | 4.29 |
| 44957.78125 | 4.11 |
| 44957.791666666664 | 3.81 |
| 44957.802083333336 | 3.69 |
| 44957.8125 | 3.61 |
| 44957.822916666664 | 3.28 |
| 44957.833333333336 | 3.19 |
| 44957.84375 | 3.14 |
| 44957.854166666664 | 2.95 |
| 44957.864583333336 | 3.06 |
| 44957.875 | 2.88 |
| 44957.885416666664 | 3.05 |
| 44957.895833333336 | 3.13 |
| 44957.90625 | 5.21 |
| 44957.916666666664 | 3.25 |
| 44957.927083333336 | 3.09 |
| 44957.9375 | 3.92 |
| 44957.947916666664 | 2.99 |
| 44957.958333333336 | 2.95 |
| 44957.96875 | 3.17 |
| 44957.979166666664 | 3.09 |
| 44957.989583333336 | 3.86 |
| 44958.0 | 4.39 |
| 44958.010416666664 | 5.31 |
| 44958.020833333336 | 5.65 |
| 44958.03125 | 5.86 |
| 44958.041666666664 | 10.83 |
| 44958.052083333336 | 9.41 |
| 44958.0625 | 10.64 |
| 44958.072916666664 | 11.66 |
| 44958.083333333336 | 11.57 |
| 44958.09375 | 11.04 |
| 44958.104166666664 | 10.8 |
| 44958.114583333336 | 9.94 |
| 44958.125 | 9.07 |
| 44958.135416666664 | 9.15 |
| 44958.145833333336 | 8.05 |